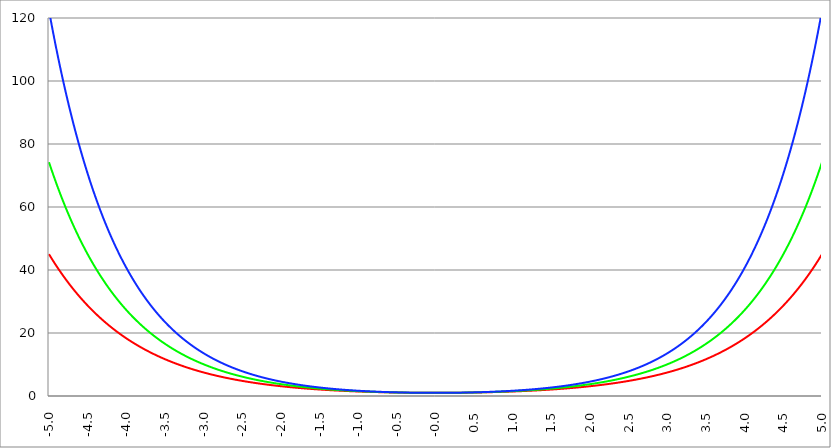
| Category | Series 1 | Series 0 | Series 2 |
|---|---|---|---|
| -5.0 | 45.014 | 74.21 | 122.348 |
| -4.995 | 44.812 | 73.84 | 121.677 |
| -4.99 | 44.611 | 73.472 | 121.01 |
| -4.985 | 44.411 | 73.105 | 120.346 |
| -4.98 | 44.211 | 72.741 | 119.686 |
| -4.975 | 44.013 | 72.378 | 119.029 |
| -4.97 | 43.815 | 72.017 | 118.377 |
| -4.965000000000001 | 43.619 | 71.658 | 117.727 |
| -4.960000000000001 | 43.423 | 71.3 | 117.082 |
| -4.955000000000001 | 43.228 | 70.945 | 116.439 |
| -4.950000000000001 | 43.034 | 70.591 | 115.801 |
| -4.945000000000001 | 42.841 | 70.239 | 115.166 |
| -4.940000000000001 | 42.648 | 69.889 | 114.534 |
| -4.935000000000001 | 42.457 | 69.54 | 113.906 |
| -4.930000000000001 | 42.266 | 69.193 | 113.281 |
| -4.925000000000002 | 42.077 | 68.848 | 112.66 |
| -4.920000000000002 | 41.888 | 68.505 | 112.042 |
| -4.915000000000002 | 41.7 | 68.163 | 111.427 |
| -4.910000000000002 | 41.513 | 67.823 | 110.816 |
| -4.905000000000002 | 41.326 | 67.485 | 110.208 |
| -4.900000000000002 | 41.141 | 67.149 | 109.604 |
| -4.895000000000002 | 40.956 | 66.814 | 109.003 |
| -4.890000000000002 | 40.772 | 66.481 | 108.405 |
| -4.885000000000002 | 40.589 | 66.149 | 107.81 |
| -4.880000000000002 | 40.407 | 65.819 | 107.219 |
| -4.875000000000003 | 40.226 | 65.491 | 106.631 |
| -4.870000000000003 | 40.045 | 65.164 | 106.046 |
| -4.865000000000003 | 39.865 | 64.839 | 105.465 |
| -4.860000000000003 | 39.687 | 64.516 | 104.886 |
| -4.855000000000003 | 39.508 | 64.194 | 104.311 |
| -4.850000000000003 | 39.331 | 63.874 | 103.739 |
| -4.845000000000003 | 39.155 | 63.556 | 103.17 |
| -4.840000000000003 | 38.979 | 63.239 | 102.604 |
| -4.835000000000003 | 38.804 | 62.923 | 102.041 |
| -4.830000000000004 | 38.63 | 62.609 | 101.482 |
| -4.825000000000004 | 38.456 | 62.297 | 100.925 |
| -4.820000000000004 | 38.284 | 61.987 | 100.371 |
| -4.815000000000004 | 38.112 | 61.677 | 99.821 |
| -4.810000000000004 | 37.941 | 61.37 | 99.273 |
| -4.805000000000004 | 37.77 | 61.064 | 98.729 |
| -4.800000000000004 | 37.601 | 60.759 | 98.187 |
| -4.795000000000004 | 37.432 | 60.456 | 97.649 |
| -4.790000000000004 | 37.264 | 60.155 | 97.113 |
| -4.785000000000004 | 37.097 | 59.855 | 96.581 |
| -4.780000000000004 | 36.93 | 59.556 | 96.051 |
| -4.775000000000004 | 36.765 | 59.259 | 95.524 |
| -4.770000000000004 | 36.6 | 58.964 | 95 |
| -4.765000000000005 | 36.435 | 58.67 | 94.479 |
| -4.760000000000005 | 36.272 | 58.377 | 93.961 |
| -4.755000000000005 | 36.109 | 58.086 | 93.446 |
| -4.750000000000005 | 35.947 | 57.796 | 92.933 |
| -4.745000000000005 | 35.786 | 57.508 | 92.424 |
| -4.740000000000005 | 35.625 | 57.221 | 91.917 |
| -4.735000000000005 | 35.465 | 56.936 | 91.413 |
| -4.730000000000005 | 35.306 | 56.652 | 90.911 |
| -4.725000000000006 | 35.148 | 56.37 | 90.413 |
| -4.720000000000006 | 34.99 | 56.089 | 89.917 |
| -4.715000000000006 | 34.833 | 55.809 | 89.424 |
| -4.710000000000006 | 34.676 | 55.531 | 88.933 |
| -4.705000000000006 | 34.521 | 55.254 | 88.445 |
| -4.700000000000006 | 34.366 | 54.978 | 87.96 |
| -4.695000000000006 | 34.212 | 54.704 | 87.478 |
| -4.690000000000006 | 34.058 | 54.431 | 86.998 |
| -4.685000000000007 | 33.905 | 54.16 | 86.521 |
| -4.680000000000007 | 33.753 | 53.89 | 86.046 |
| -4.675000000000007 | 33.602 | 53.621 | 85.574 |
| -4.670000000000007 | 33.451 | 53.354 | 85.105 |
| -4.665000000000007 | 33.301 | 53.088 | 84.638 |
| -4.660000000000007 | 33.151 | 52.823 | 84.174 |
| -4.655000000000007 | 33.002 | 52.559 | 83.713 |
| -4.650000000000007 | 32.854 | 52.297 | 83.253 |
| -4.645000000000007 | 32.707 | 52.036 | 82.797 |
| -4.640000000000008 | 32.56 | 51.777 | 82.343 |
| -4.635000000000008 | 32.414 | 51.519 | 81.891 |
| -4.630000000000008 | 32.269 | 51.262 | 81.442 |
| -4.625000000000008 | 32.124 | 51.006 | 80.995 |
| -4.620000000000008 | 31.98 | 50.752 | 80.551 |
| -4.615000000000008 | 31.836 | 50.499 | 80.109 |
| -4.610000000000008 | 31.693 | 50.247 | 79.67 |
| -4.605000000000008 | 31.551 | 49.996 | 79.233 |
| -4.600000000000008 | 31.409 | 49.747 | 78.798 |
| -4.595000000000009 | 31.268 | 49.499 | 78.366 |
| -4.590000000000009 | 31.128 | 49.252 | 77.936 |
| -4.585000000000009 | 30.988 | 49.007 | 77.509 |
| -4.580000000000009 | 30.849 | 48.762 | 77.084 |
| -4.57500000000001 | 30.711 | 48.519 | 76.661 |
| -4.57000000000001 | 30.573 | 48.277 | 76.241 |
| -4.565000000000009 | 30.436 | 48.037 | 75.823 |
| -4.560000000000009 | 30.299 | 47.797 | 75.407 |
| -4.555000000000009 | 30.163 | 47.559 | 74.993 |
| -4.55000000000001 | 30.028 | 47.321 | 74.582 |
| -4.54500000000001 | 29.893 | 47.086 | 74.173 |
| -4.54000000000001 | 29.759 | 46.851 | 73.766 |
| -4.53500000000001 | 29.626 | 46.617 | 73.361 |
| -4.53000000000001 | 29.493 | 46.385 | 72.959 |
| -4.52500000000001 | 29.36 | 46.153 | 72.559 |
| -4.52000000000001 | 29.229 | 45.923 | 72.161 |
| -4.51500000000001 | 29.097 | 45.694 | 71.765 |
| -4.51000000000001 | 28.967 | 45.466 | 71.372 |
| -4.505000000000011 | 28.837 | 45.24 | 70.98 |
| -4.500000000000011 | 28.707 | 45.014 | 70.591 |
| -4.495000000000011 | 28.579 | 44.79 | 70.204 |
| -4.490000000000011 | 28.45 | 44.566 | 69.819 |
| -4.485000000000011 | 28.323 | 44.344 | 69.436 |
| -4.480000000000011 | 28.196 | 44.123 | 69.055 |
| -4.475000000000011 | 28.069 | 43.903 | 68.676 |
| -4.470000000000011 | 27.943 | 43.684 | 68.3 |
| -4.465000000000011 | 27.818 | 43.466 | 67.925 |
| -4.460000000000011 | 27.693 | 43.25 | 67.553 |
| -4.455000000000012 | 27.569 | 43.034 | 67.182 |
| -4.450000000000012 | 27.445 | 42.819 | 66.814 |
| -4.445000000000012 | 27.322 | 42.606 | 66.447 |
| -4.440000000000012 | 27.199 | 42.393 | 66.083 |
| -4.435000000000012 | 27.077 | 42.182 | 65.72 |
| -4.430000000000012 | 26.956 | 41.972 | 65.36 |
| -4.425000000000012 | 26.835 | 41.762 | 65.002 |
| -4.420000000000012 | 26.714 | 41.554 | 64.645 |
| -4.415000000000012 | 26.595 | 41.347 | 64.291 |
| -4.410000000000013 | 26.475 | 41.141 | 63.938 |
| -4.405000000000013 | 26.356 | 40.936 | 63.587 |
| -4.400000000000013 | 26.238 | 40.732 | 63.239 |
| -4.395000000000013 | 26.12 | 40.528 | 62.892 |
| -4.390000000000013 | 26.003 | 40.326 | 62.547 |
| -4.385000000000013 | 25.887 | 40.125 | 62.204 |
| -4.380000000000013 | 25.77 | 39.925 | 61.863 |
| -4.375000000000013 | 25.655 | 39.726 | 61.523 |
| -4.370000000000013 | 25.54 | 39.528 | 61.186 |
| -4.365000000000013 | 25.425 | 39.331 | 60.851 |
| -4.360000000000014 | 25.311 | 39.135 | 60.517 |
| -4.355000000000014 | 25.198 | 38.94 | 60.185 |
| -4.350000000000014 | 25.085 | 38.746 | 59.855 |
| -4.345000000000014 | 24.972 | 38.553 | 59.527 |
| -4.340000000000014 | 24.86 | 38.36 | 59.2 |
| -4.335000000000014 | 24.748 | 38.169 | 58.875 |
| -4.330000000000014 | 24.637 | 37.979 | 58.553 |
| -4.325000000000014 | 24.527 | 37.789 | 58.232 |
| -4.320000000000014 | 24.417 | 37.601 | 57.912 |
| -4.315000000000015 | 24.307 | 37.413 | 57.595 |
| -4.310000000000015 | 24.198 | 37.227 | 57.279 |
| -4.305000000000015 | 24.09 | 37.041 | 56.965 |
| -4.300000000000015 | 23.982 | 36.857 | 56.652 |
| -4.295000000000015 | 23.874 | 36.673 | 56.342 |
| -4.290000000000015 | 23.767 | 36.49 | 56.033 |
| -4.285000000000015 | 23.66 | 36.308 | 55.725 |
| -4.280000000000015 | 23.554 | 36.127 | 55.42 |
| -4.275000000000015 | 23.449 | 35.947 | 55.116 |
| -4.270000000000015 | 23.343 | 35.768 | 54.813 |
| -4.265000000000016 | 23.239 | 35.589 | 54.513 |
| -4.260000000000016 | 23.134 | 35.412 | 54.214 |
| -4.255000000000016 | 23.031 | 35.236 | 53.917 |
| -4.250000000000016 | 22.927 | 35.06 | 53.621 |
| -4.245000000000016 | 22.824 | 34.885 | 53.327 |
| -4.240000000000016 | 22.722 | 34.711 | 53.034 |
| -4.235000000000016 | 22.62 | 34.538 | 52.744 |
| -4.230000000000016 | 22.519 | 34.366 | 52.454 |
| -4.225000000000017 | 22.418 | 34.195 | 52.167 |
| -4.220000000000017 | 22.317 | 34.024 | 51.881 |
| -4.215000000000017 | 22.217 | 33.854 | 51.596 |
| -4.210000000000017 | 22.117 | 33.686 | 51.313 |
| -4.205000000000017 | 22.018 | 33.518 | 51.032 |
| -4.200000000000017 | 21.919 | 33.351 | 50.752 |
| -4.195000000000017 | 21.821 | 33.184 | 50.474 |
| -4.190000000000017 | 21.723 | 33.019 | 50.197 |
| -4.185000000000017 | 21.626 | 32.854 | 49.922 |
| -4.180000000000017 | 21.529 | 32.691 | 49.648 |
| -4.175000000000018 | 21.432 | 32.528 | 49.376 |
| -4.170000000000018 | 21.336 | 32.365 | 49.105 |
| -4.165000000000018 | 21.24 | 32.204 | 48.836 |
| -4.160000000000018 | 21.145 | 32.044 | 48.568 |
| -4.155000000000018 | 21.05 | 31.884 | 48.301 |
| -4.150000000000018 | 20.956 | 31.725 | 48.037 |
| -4.145000000000018 | 20.862 | 31.567 | 47.773 |
| -4.140000000000018 | 20.768 | 31.409 | 47.511 |
| -4.135000000000018 | 20.675 | 31.253 | 47.251 |
| -4.130000000000019 | 20.583 | 31.097 | 46.991 |
| -4.125000000000019 | 20.49 | 30.942 | 46.734 |
| -4.120000000000019 | 20.398 | 30.788 | 46.478 |
| -4.115000000000019 | 20.307 | 30.634 | 46.223 |
| -4.110000000000019 | 20.216 | 30.482 | 45.969 |
| -4.105000000000019 | 20.125 | 30.33 | 45.717 |
| -4.100000000000019 | 20.035 | 30.178 | 45.466 |
| -4.095000000000019 | 19.945 | 30.028 | 45.217 |
| -4.090000000000019 | 19.856 | 29.878 | 44.969 |
| -4.085000000000019 | 19.767 | 29.729 | 44.723 |
| -4.08000000000002 | 19.678 | 29.581 | 44.477 |
| -4.07500000000002 | 19.59 | 29.434 | 44.233 |
| -4.07000000000002 | 19.502 | 29.287 | 43.991 |
| -4.06500000000002 | 19.414 | 29.141 | 43.75 |
| -4.06000000000002 | 19.327 | 28.996 | 43.51 |
| -4.05500000000002 | 19.241 | 28.851 | 43.271 |
| -4.05000000000002 | 19.154 | 28.707 | 43.034 |
| -4.04500000000002 | 19.069 | 28.564 | 42.798 |
| -4.04000000000002 | 18.983 | 28.422 | 42.563 |
| -4.03500000000002 | 18.898 | 28.28 | 42.33 |
| -4.03000000000002 | 18.813 | 28.139 | 42.098 |
| -4.025000000000021 | 18.729 | 27.999 | 41.867 |
| -4.020000000000021 | 18.645 | 27.86 | 41.637 |
| -4.015000000000021 | 18.561 | 27.721 | 41.409 |
| -4.010000000000021 | 18.478 | 27.583 | 41.182 |
| -4.005000000000021 | 18.395 | 27.445 | 40.956 |
| -4.000000000000021 | 18.313 | 27.308 | 40.732 |
| -3.995000000000021 | 18.231 | 27.172 | 40.508 |
| -3.990000000000021 | 18.149 | 27.037 | 40.286 |
| -3.985000000000022 | 18.068 | 26.902 | 40.065 |
| -3.980000000000022 | 17.987 | 26.768 | 39.846 |
| -3.975000000000022 | 17.906 | 26.634 | 39.627 |
| -3.970000000000022 | 17.826 | 26.502 | 39.41 |
| -3.965000000000022 | 17.746 | 26.37 | 39.194 |
| -3.960000000000022 | 17.666 | 26.238 | 38.979 |
| -3.955000000000022 | 17.587 | 26.107 | 38.765 |
| -3.950000000000022 | 17.508 | 25.977 | 38.553 |
| -3.945000000000022 | 17.43 | 25.848 | 38.341 |
| -3.940000000000023 | 17.352 | 25.719 | 38.131 |
| -3.935000000000023 | 17.274 | 25.591 | 37.922 |
| -3.930000000000023 | 17.196 | 25.463 | 37.714 |
| -3.925000000000023 | 17.119 | 25.336 | 37.507 |
| -3.920000000000023 | 17.043 | 25.21 | 37.301 |
| -3.915000000000023 | 16.966 | 25.085 | 37.097 |
| -3.910000000000023 | 16.89 | 24.959 | 36.894 |
| -3.905000000000023 | 16.814 | 24.835 | 36.691 |
| -3.900000000000023 | 16.739 | 24.711 | 36.49 |
| -3.895000000000023 | 16.664 | 24.588 | 36.29 |
| -3.890000000000024 | 16.589 | 24.466 | 36.091 |
| -3.885000000000024 | 16.515 | 24.344 | 35.893 |
| -3.880000000000024 | 16.441 | 24.222 | 35.696 |
| -3.875000000000024 | 16.367 | 24.102 | 35.501 |
| -3.870000000000024 | 16.294 | 23.982 | 35.306 |
| -3.865000000000024 | 16.221 | 23.862 | 35.112 |
| -3.860000000000024 | 16.148 | 23.743 | 34.92 |
| -3.855000000000024 | 16.076 | 23.625 | 34.728 |
| -3.850000000000024 | 16.004 | 23.507 | 34.538 |
| -3.845000000000025 | 15.932 | 23.39 | 34.349 |
| -3.840000000000025 | 15.861 | 23.273 | 34.16 |
| -3.835000000000025 | 15.79 | 23.158 | 33.973 |
| -3.830000000000025 | 15.719 | 23.042 | 33.787 |
| -3.825000000000025 | 15.649 | 22.927 | 33.602 |
| -3.820000000000025 | 15.578 | 22.813 | 33.417 |
| -3.815000000000025 | 15.509 | 22.699 | 33.234 |
| -3.810000000000025 | 15.439 | 22.586 | 33.052 |
| -3.805000000000025 | 15.37 | 22.474 | 32.871 |
| -3.800000000000026 | 15.301 | 22.362 | 32.691 |
| -3.795000000000026 | 15.233 | 22.25 | 32.511 |
| -3.790000000000026 | 15.164 | 22.139 | 32.333 |
| -3.785000000000026 | 15.096 | 22.029 | 32.156 |
| -3.780000000000026 | 15.029 | 21.919 | 31.98 |
| -3.775000000000026 | 14.961 | 21.81 | 31.804 |
| -3.770000000000026 | 14.894 | 21.702 | 31.63 |
| -3.765000000000026 | 14.828 | 21.593 | 31.456 |
| -3.760000000000026 | 14.761 | 21.486 | 31.284 |
| -3.755000000000026 | 14.695 | 21.379 | 31.113 |
| -3.750000000000027 | 14.629 | 21.272 | 30.942 |
| -3.745000000000027 | 14.564 | 21.166 | 30.772 |
| -3.740000000000027 | 14.498 | 21.061 | 30.604 |
| -3.735000000000027 | 14.434 | 20.956 | 30.436 |
| -3.730000000000027 | 14.369 | 20.852 | 30.269 |
| -3.725000000000027 | 14.305 | 20.748 | 30.103 |
| -3.720000000000027 | 14.24 | 20.644 | 29.938 |
| -3.715000000000027 | 14.177 | 20.541 | 29.774 |
| -3.710000000000027 | 14.113 | 20.439 | 29.611 |
| -3.705000000000028 | 14.05 | 20.337 | 29.448 |
| -3.700000000000028 | 13.987 | 20.236 | 29.287 |
| -3.695000000000028 | 13.924 | 20.135 | 29.126 |
| -3.690000000000028 | 13.862 | 20.035 | 28.967 |
| -3.685000000000028 | 13.8 | 19.935 | 28.808 |
| -3.680000000000028 | 13.738 | 19.836 | 28.65 |
| -3.675000000000028 | 13.677 | 19.737 | 28.493 |
| -3.670000000000028 | 13.615 | 19.639 | 28.337 |
| -3.665000000000028 | 13.554 | 19.541 | 28.182 |
| -3.660000000000028 | 13.494 | 19.444 | 28.027 |
| -3.655000000000029 | 13.433 | 19.347 | 27.873 |
| -3.650000000000029 | 13.373 | 19.25 | 27.721 |
| -3.645000000000029 | 13.313 | 19.154 | 27.569 |
| -3.640000000000029 | 13.254 | 19.059 | 27.418 |
| -3.635000000000029 | 13.194 | 18.964 | 27.267 |
| -3.630000000000029 | 13.135 | 18.87 | 27.118 |
| -3.625000000000029 | 13.077 | 18.776 | 26.969 |
| -3.620000000000029 | 13.018 | 18.682 | 26.821 |
| -3.615000000000029 | 12.96 | 18.589 | 26.674 |
| -3.61000000000003 | 12.902 | 18.497 | 26.528 |
| -3.60500000000003 | 12.844 | 18.404 | 26.383 |
| -3.60000000000003 | 12.786 | 18.313 | 26.238 |
| -3.59500000000003 | 12.729 | 18.222 | 26.094 |
| -3.59000000000003 | 12.672 | 18.131 | 25.951 |
| -3.58500000000003 | 12.616 | 18.041 | 25.809 |
| -3.58000000000003 | 12.559 | 17.951 | 25.668 |
| -3.57500000000003 | 12.503 | 17.861 | 25.527 |
| -3.57000000000003 | 12.447 | 17.772 | 25.387 |
| -3.565000000000031 | 12.391 | 17.684 | 25.248 |
| -3.560000000000031 | 12.336 | 17.596 | 25.11 |
| -3.555000000000031 | 12.281 | 17.508 | 24.972 |
| -3.550000000000031 | 12.226 | 17.421 | 24.835 |
| -3.545000000000031 | 12.171 | 17.334 | 24.699 |
| -3.540000000000031 | 12.116 | 17.248 | 24.564 |
| -3.535000000000031 | 12.062 | 17.162 | 24.429 |
| -3.530000000000031 | 12.008 | 17.077 | 24.295 |
| -3.525000000000031 | 11.954 | 16.992 | 24.162 |
| -3.520000000000032 | 11.901 | 16.907 | 24.03 |
| -3.515000000000032 | 11.848 | 16.823 | 23.898 |
| -3.510000000000032 | 11.795 | 16.739 | 23.767 |
| -3.505000000000032 | 11.742 | 16.656 | 23.637 |
| -3.500000000000032 | 11.689 | 16.573 | 23.507 |
| -3.495000000000032 | 11.637 | 16.49 | 23.378 |
| -3.490000000000032 | 11.585 | 16.408 | 23.25 |
| -3.485000000000032 | 11.533 | 16.327 | 23.123 |
| -3.480000000000032 | 11.482 | 16.245 | 22.996 |
| -3.475000000000032 | 11.43 | 16.164 | 22.87 |
| -3.470000000000033 | 11.379 | 16.084 | 22.745 |
| -3.465000000000033 | 11.328 | 16.004 | 22.62 |
| -3.460000000000033 | 11.278 | 15.924 | 22.496 |
| -3.455000000000033 | 11.227 | 15.845 | 22.373 |
| -3.450000000000033 | 11.177 | 15.766 | 22.25 |
| -3.445000000000033 | 11.127 | 15.688 | 22.128 |
| -3.440000000000033 | 11.077 | 15.61 | 22.007 |
| -3.435000000000033 | 11.028 | 15.532 | 21.887 |
| -3.430000000000033 | 10.978 | 15.455 | 21.767 |
| -3.425000000000034 | 10.929 | 15.378 | 21.647 |
| -3.420000000000034 | 10.88 | 15.301 | 21.529 |
| -3.415000000000034 | 10.832 | 15.225 | 21.411 |
| -3.410000000000034 | 10.783 | 15.149 | 21.294 |
| -3.405000000000034 | 10.735 | 15.074 | 21.177 |
| -3.400000000000034 | 10.687 | 14.999 | 21.061 |
| -3.395000000000034 | 10.639 | 14.924 | 20.945 |
| -3.390000000000034 | 10.592 | 14.85 | 20.831 |
| -3.385000000000034 | 10.545 | 14.776 | 20.717 |
| -3.380000000000034 | 10.497 | 14.702 | 20.603 |
| -3.375000000000035 | 10.451 | 14.629 | 20.49 |
| -3.370000000000035 | 10.404 | 14.556 | 20.378 |
| -3.365000000000035 | 10.357 | 14.484 | 20.266 |
| -3.360000000000035 | 10.311 | 14.412 | 20.155 |
| -3.355000000000035 | 10.265 | 14.34 | 20.045 |
| -3.350000000000035 | 10.219 | 14.269 | 19.935 |
| -3.345000000000035 | 10.173 | 14.198 | 19.826 |
| -3.340000000000035 | 10.128 | 14.127 | 19.717 |
| -3.335000000000035 | 10.083 | 14.057 | 19.609 |
| -3.330000000000036 | 10.038 | 13.987 | 19.502 |
| -3.325000000000036 | 9.993 | 13.917 | 19.395 |
| -3.320000000000036 | 9.948 | 13.848 | 19.289 |
| -3.315000000000036 | 9.904 | 13.779 | 19.183 |
| -3.310000000000036 | 9.859 | 13.711 | 19.078 |
| -3.305000000000036 | 9.815 | 13.643 | 18.974 |
| -3.300000000000036 | 9.772 | 13.575 | 18.87 |
| -3.295000000000036 | 9.728 | 13.507 | 18.766 |
| -3.290000000000036 | 9.685 | 13.44 | 18.664 |
| -3.285000000000036 | 9.641 | 13.373 | 18.561 |
| -3.280000000000036 | 9.598 | 13.307 | 18.46 |
| -3.275000000000037 | 9.555 | 13.241 | 18.359 |
| -3.270000000000037 | 9.513 | 13.175 | 18.258 |
| -3.265000000000037 | 9.47 | 13.109 | 18.158 |
| -3.260000000000037 | 9.428 | 13.044 | 18.059 |
| -3.255000000000037 | 9.386 | 12.979 | 17.96 |
| -3.250000000000037 | 9.344 | 12.915 | 17.861 |
| -3.245000000000037 | 9.302 | 12.85 | 17.764 |
| -3.240000000000037 | 9.261 | 12.786 | 17.666 |
| -3.235000000000038 | 9.219 | 12.723 | 17.569 |
| -3.230000000000038 | 9.178 | 12.66 | 17.473 |
| -3.225000000000038 | 9.137 | 12.597 | 17.378 |
| -3.220000000000038 | 9.096 | 12.534 | 17.282 |
| -3.215000000000038 | 9.056 | 12.472 | 17.188 |
| -3.210000000000038 | 9.015 | 12.41 | 17.094 |
| -3.205000000000038 | 8.975 | 12.348 | 17 |
| -3.200000000000038 | 8.935 | 12.287 | 16.907 |
| -3.195000000000038 | 8.895 | 12.226 | 16.814 |
| -3.190000000000039 | 8.856 | 12.165 | 16.722 |
| -3.185000000000039 | 8.816 | 12.104 | 16.631 |
| -3.180000000000039 | 8.777 | 12.044 | 16.54 |
| -3.175000000000039 | 8.738 | 11.984 | 16.449 |
| -3.170000000000039 | 8.699 | 11.925 | 16.359 |
| -3.16500000000004 | 8.66 | 11.865 | 16.27 |
| -3.16000000000004 | 8.621 | 11.807 | 16.181 |
| -3.155000000000039 | 8.583 | 11.748 | 16.092 |
| -3.150000000000039 | 8.545 | 11.689 | 16.004 |
| -3.14500000000004 | 8.506 | 11.631 | 15.916 |
| -3.14000000000004 | 8.469 | 11.574 | 15.829 |
| -3.13500000000004 | 8.431 | 11.516 | 15.742 |
| -3.13000000000004 | 8.393 | 11.459 | 15.656 |
| -3.12500000000004 | 8.356 | 11.402 | 15.571 |
| -3.12000000000004 | 8.319 | 11.345 | 15.485 |
| -3.11500000000004 | 8.281 | 11.289 | 15.401 |
| -3.11000000000004 | 8.245 | 11.233 | 15.316 |
| -3.10500000000004 | 8.208 | 11.177 | 15.233 |
| -3.10000000000004 | 8.171 | 11.122 | 15.149 |
| -3.095000000000041 | 8.135 | 11.066 | 15.066 |
| -3.090000000000041 | 8.099 | 11.011 | 14.984 |
| -3.085000000000041 | 8.062 | 10.957 | 14.902 |
| -3.080000000000041 | 8.027 | 10.902 | 14.82 |
| -3.075000000000041 | 7.991 | 10.848 | 14.739 |
| -3.070000000000041 | 7.955 | 10.794 | 14.658 |
| -3.065000000000041 | 7.92 | 10.741 | 14.578 |
| -3.060000000000041 | 7.885 | 10.687 | 14.498 |
| -3.055000000000041 | 7.849 | 10.634 | 14.419 |
| -3.050000000000042 | 7.814 | 10.581 | 14.34 |
| -3.045000000000042 | 7.78 | 10.529 | 14.262 |
| -3.040000000000042 | 7.745 | 10.477 | 14.184 |
| -3.035000000000042 | 7.711 | 10.425 | 14.106 |
| -3.030000000000042 | 7.676 | 10.373 | 14.029 |
| -3.025000000000042 | 7.642 | 10.321 | 13.952 |
| -3.020000000000042 | 7.608 | 10.27 | 13.876 |
| -3.015000000000042 | 7.574 | 10.219 | 13.8 |
| -3.010000000000042 | 7.54 | 10.168 | 13.725 |
| -3.005000000000043 | 7.507 | 10.118 | 13.649 |
| -3.000000000000043 | 7.473 | 10.068 | 13.575 |
| -2.995000000000043 | 7.44 | 10.018 | 13.501 |
| -2.990000000000043 | 7.407 | 9.968 | 13.427 |
| -2.985000000000043 | 7.374 | 9.919 | 13.353 |
| -2.980000000000043 | 7.341 | 9.869 | 13.28 |
| -2.975000000000043 | 7.309 | 9.82 | 13.208 |
| -2.970000000000043 | 7.276 | 9.772 | 13.135 |
| -2.965000000000043 | 7.244 | 9.723 | 13.063 |
| -2.960000000000043 | 7.212 | 9.675 | 12.992 |
| -2.955000000000044 | 7.18 | 9.627 | 12.921 |
| -2.950000000000044 | 7.148 | 9.579 | 12.85 |
| -2.945000000000044 | 7.116 | 9.532 | 12.78 |
| -2.940000000000044 | 7.084 | 9.484 | 12.71 |
| -2.935000000000044 | 7.053 | 9.437 | 12.641 |
| -2.930000000000044 | 7.021 | 9.391 | 12.572 |
| -2.925000000000044 | 6.99 | 9.344 | 12.503 |
| -2.920000000000044 | 6.959 | 9.298 | 12.434 |
| -2.915000000000044 | 6.928 | 9.252 | 12.367 |
| -2.910000000000045 | 6.897 | 9.206 | 12.299 |
| -2.905000000000045 | 6.867 | 9.16 | 12.232 |
| -2.900000000000045 | 6.836 | 9.115 | 12.165 |
| -2.895000000000045 | 6.806 | 9.069 | 12.098 |
| -2.890000000000045 | 6.776 | 9.024 | 12.032 |
| -2.885000000000045 | 6.746 | 8.98 | 11.966 |
| -2.880000000000045 | 6.716 | 8.935 | 11.901 |
| -2.875000000000045 | 6.686 | 8.891 | 11.836 |
| -2.870000000000045 | 6.656 | 8.847 | 11.771 |
| -2.865000000000045 | 6.627 | 8.803 | 11.707 |
| -2.860000000000046 | 6.597 | 8.759 | 11.643 |
| -2.855000000000046 | 6.568 | 8.716 | 11.579 |
| -2.850000000000046 | 6.539 | 8.673 | 11.516 |
| -2.845000000000046 | 6.51 | 8.63 | 11.453 |
| -2.840000000000046 | 6.481 | 8.587 | 11.391 |
| -2.835000000000046 | 6.452 | 8.545 | 11.328 |
| -2.830000000000046 | 6.424 | 8.502 | 11.266 |
| -2.825000000000046 | 6.395 | 8.46 | 11.205 |
| -2.820000000000046 | 6.367 | 8.418 | 11.144 |
| -2.815000000000047 | 6.338 | 8.377 | 11.083 |
| -2.810000000000047 | 6.31 | 8.335 | 11.022 |
| -2.805000000000047 | 6.282 | 8.294 | 10.962 |
| -2.800000000000047 | 6.255 | 8.253 | 10.902 |
| -2.795000000000047 | 6.227 | 8.212 | 10.843 |
| -2.790000000000047 | 6.199 | 8.171 | 10.783 |
| -2.785000000000047 | 6.172 | 8.131 | 10.725 |
| -2.780000000000047 | 6.144 | 8.091 | 10.666 |
| -2.775000000000047 | 6.117 | 8.05 | 10.608 |
| -2.770000000000047 | 6.09 | 8.011 | 10.55 |
| -2.765000000000048 | 6.063 | 7.971 | 10.492 |
| -2.760000000000048 | 6.036 | 7.932 | 10.435 |
| -2.755000000000048 | 6.01 | 7.892 | 10.378 |
| -2.750000000000048 | 5.983 | 7.853 | 10.321 |
| -2.745000000000048 | 5.956 | 7.814 | 10.265 |
| -2.740000000000048 | 5.93 | 7.776 | 10.209 |
| -2.735000000000048 | 5.904 | 7.737 | 10.153 |
| -2.730000000000048 | 5.878 | 7.699 | 10.098 |
| -2.725000000000048 | 5.852 | 7.661 | 10.043 |
| -2.720000000000049 | 5.826 | 7.623 | 9.988 |
| -2.715000000000049 | 5.8 | 7.585 | 9.933 |
| -2.710000000000049 | 5.774 | 7.548 | 9.879 |
| -2.705000000000049 | 5.749 | 7.511 | 9.825 |
| -2.700000000000049 | 5.723 | 7.473 | 9.772 |
| -2.695000000000049 | 5.698 | 7.437 | 9.718 |
| -2.690000000000049 | 5.673 | 7.4 | 9.665 |
| -2.685000000000049 | 5.648 | 7.363 | 9.613 |
| -2.680000000000049 | 5.623 | 7.327 | 9.56 |
| -2.675000000000049 | 5.598 | 7.291 | 9.508 |
| -2.67000000000005 | 5.573 | 7.255 | 9.456 |
| -2.66500000000005 | 5.549 | 7.219 | 9.405 |
| -2.66000000000005 | 5.524 | 7.183 | 9.353 |
| -2.65500000000005 | 5.5 | 7.148 | 9.302 |
| -2.65000000000005 | 5.476 | 7.112 | 9.252 |
| -2.64500000000005 | 5.451 | 7.077 | 9.201 |
| -2.64000000000005 | 5.427 | 7.042 | 9.151 |
| -2.63500000000005 | 5.403 | 7.008 | 9.101 |
| -2.63000000000005 | 5.38 | 6.973 | 9.051 |
| -2.625000000000051 | 5.356 | 6.939 | 9.002 |
| -2.620000000000051 | 5.332 | 6.904 | 8.953 |
| -2.615000000000051 | 5.309 | 6.87 | 8.904 |
| -2.610000000000051 | 5.285 | 6.836 | 8.856 |
| -2.605000000000051 | 5.262 | 6.803 | 8.807 |
| -2.600000000000051 | 5.239 | 6.769 | 8.759 |
| -2.595000000000051 | 5.216 | 6.736 | 8.712 |
| -2.590000000000051 | 5.193 | 6.702 | 8.664 |
| -2.585000000000051 | 5.17 | 6.669 | 8.617 |
| -2.580000000000052 | 5.147 | 6.636 | 8.57 |
| -2.575000000000052 | 5.124 | 6.604 | 8.523 |
| -2.570000000000052 | 5.102 | 6.571 | 8.477 |
| -2.565000000000052 | 5.079 | 6.539 | 8.431 |
| -2.560000000000052 | 5.057 | 6.507 | 8.385 |
| -2.555000000000052 | 5.035 | 6.474 | 8.339 |
| -2.550000000000052 | 5.013 | 6.443 | 8.294 |
| -2.545000000000052 | 4.991 | 6.411 | 8.249 |
| -2.540000000000052 | 4.969 | 6.379 | 8.204 |
| -2.535000000000053 | 4.947 | 6.348 | 8.159 |
| -2.530000000000053 | 4.925 | 6.317 | 8.115 |
| -2.525000000000053 | 4.903 | 6.285 | 8.07 |
| -2.520000000000053 | 4.882 | 6.255 | 8.027 |
| -2.515000000000053 | 4.86 | 6.224 | 7.983 |
| -2.510000000000053 | 4.839 | 6.193 | 7.939 |
| -2.505000000000053 | 4.818 | 6.163 | 7.896 |
| -2.500000000000053 | 4.797 | 6.132 | 7.853 |
| -2.495000000000053 | 4.776 | 6.102 | 7.811 |
| -2.490000000000053 | 4.755 | 6.072 | 7.768 |
| -2.485000000000054 | 4.734 | 6.042 | 7.726 |
| -2.480000000000054 | 4.713 | 6.013 | 7.684 |
| -2.475000000000054 | 4.692 | 5.983 | 7.642 |
| -2.470000000000054 | 4.672 | 5.954 | 7.6 |
| -2.465000000000054 | 4.651 | 5.924 | 7.559 |
| -2.460000000000054 | 4.631 | 5.895 | 7.518 |
| -2.455000000000054 | 4.61 | 5.866 | 7.477 |
| -2.450000000000054 | 4.59 | 5.837 | 7.437 |
| -2.445000000000054 | 4.57 | 5.809 | 7.396 |
| -2.440000000000055 | 4.55 | 5.78 | 7.356 |
| -2.435000000000055 | 4.53 | 5.752 | 7.316 |
| -2.430000000000055 | 4.51 | 5.723 | 7.276 |
| -2.425000000000055 | 4.491 | 5.695 | 7.237 |
| -2.420000000000055 | 4.471 | 5.667 | 7.197 |
| -2.415000000000055 | 4.451 | 5.64 | 7.158 |
| -2.410000000000055 | 4.432 | 5.612 | 7.119 |
| -2.405000000000055 | 4.413 | 5.584 | 7.081 |
| -2.400000000000055 | 4.393 | 5.557 | 7.042 |
| -2.395000000000055 | 4.374 | 5.53 | 7.004 |
| -2.390000000000056 | 4.355 | 5.503 | 6.966 |
| -2.385000000000056 | 4.336 | 5.476 | 6.928 |
| -2.380000000000056 | 4.317 | 5.449 | 6.891 |
| -2.375000000000056 | 4.298 | 5.422 | 6.853 |
| -2.370000000000056 | 4.279 | 5.395 | 6.816 |
| -2.365000000000056 | 4.261 | 5.369 | 6.779 |
| -2.360000000000056 | 4.242 | 5.343 | 6.742 |
| -2.355000000000056 | 4.224 | 5.317 | 6.706 |
| -2.350000000000056 | 4.205 | 5.29 | 6.669 |
| -2.345000000000057 | 4.187 | 5.265 | 6.633 |
| -2.340000000000057 | 4.169 | 5.239 | 6.597 |
| -2.335000000000057 | 4.15 | 5.213 | 6.561 |
| -2.330000000000057 | 4.132 | 5.188 | 6.526 |
| -2.325000000000057 | 4.114 | 5.162 | 6.491 |
| -2.320000000000057 | 4.096 | 5.137 | 6.455 |
| -2.315000000000057 | 4.079 | 5.112 | 6.42 |
| -2.310000000000057 | 4.061 | 5.087 | 6.386 |
| -2.305000000000057 | 4.043 | 5.062 | 6.351 |
| -2.300000000000058 | 4.026 | 5.037 | 6.317 |
| -2.295000000000058 | 4.008 | 5.013 | 6.282 |
| -2.290000000000058 | 3.991 | 4.988 | 6.248 |
| -2.285000000000058 | 3.973 | 4.964 | 6.215 |
| -2.280000000000058 | 3.956 | 4.939 | 6.181 |
| -2.275000000000058 | 3.939 | 4.915 | 6.147 |
| -2.270000000000058 | 3.922 | 4.891 | 6.114 |
| -2.265000000000058 | 3.905 | 4.867 | 6.081 |
| -2.260000000000058 | 3.888 | 4.844 | 6.048 |
| -2.255000000000058 | 3.871 | 4.82 | 6.015 |
| -2.250000000000059 | 3.854 | 4.797 | 5.983 |
| -2.245000000000059 | 3.837 | 4.773 | 5.951 |
| -2.240000000000059 | 3.821 | 4.75 | 5.918 |
| -2.235000000000059 | 3.804 | 4.727 | 5.886 |
| -2.23000000000006 | 3.788 | 4.704 | 5.855 |
| -2.22500000000006 | 3.771 | 4.681 | 5.823 |
| -2.22000000000006 | 3.755 | 4.658 | 5.791 |
| -2.215000000000059 | 3.739 | 4.635 | 5.76 |
| -2.210000000000059 | 3.723 | 4.613 | 5.729 |
| -2.20500000000006 | 3.706 | 4.59 | 5.698 |
| -2.20000000000006 | 3.69 | 4.568 | 5.667 |
| -2.19500000000006 | 3.674 | 4.546 | 5.637 |
| -2.19000000000006 | 3.659 | 4.524 | 5.606 |
| -2.18500000000006 | 3.643 | 4.502 | 5.576 |
| -2.18000000000006 | 3.627 | 4.48 | 5.546 |
| -2.17500000000006 | 3.611 | 4.458 | 5.516 |
| -2.17000000000006 | 3.596 | 4.436 | 5.486 |
| -2.16500000000006 | 3.58 | 4.415 | 5.457 |
| -2.160000000000061 | 3.565 | 4.393 | 5.427 |
| -2.155000000000061 | 3.55 | 4.372 | 5.398 |
| -2.150000000000061 | 3.534 | 4.351 | 5.369 |
| -2.145000000000061 | 3.519 | 4.33 | 5.34 |
| -2.140000000000061 | 3.504 | 4.309 | 5.311 |
| -2.135000000000061 | 3.489 | 4.288 | 5.283 |
| -2.130000000000061 | 3.474 | 4.267 | 5.254 |
| -2.125000000000061 | 3.459 | 4.246 | 5.226 |
| -2.120000000000061 | 3.444 | 4.226 | 5.198 |
| -2.115000000000061 | 3.429 | 4.205 | 5.17 |
| -2.110000000000062 | 3.414 | 4.185 | 5.142 |
| -2.105000000000062 | 3.4 | 4.164 | 5.114 |
| -2.100000000000062 | 3.385 | 4.144 | 5.087 |
| -2.095000000000062 | 3.371 | 4.124 | 5.059 |
| -2.090000000000062 | 3.356 | 4.104 | 5.032 |
| -2.085000000000062 | 3.342 | 4.084 | 5.005 |
| -2.080000000000062 | 3.328 | 4.065 | 4.978 |
| -2.075000000000062 | 3.313 | 4.045 | 4.952 |
| -2.070000000000062 | 3.299 | 4.026 | 4.925 |
| -2.065000000000063 | 3.285 | 4.006 | 4.899 |
| -2.060000000000063 | 3.271 | 3.987 | 4.872 |
| -2.055000000000063 | 3.257 | 3.967 | 4.846 |
| -2.050000000000063 | 3.243 | 3.948 | 4.82 |
| -2.045000000000063 | 3.229 | 3.929 | 4.794 |
| -2.040000000000063 | 3.215 | 3.91 | 4.769 |
| -2.035000000000063 | 3.202 | 3.891 | 4.743 |
| -2.030000000000063 | 3.188 | 3.873 | 4.718 |
| -2.025000000000063 | 3.174 | 3.854 | 4.692 |
| -2.020000000000064 | 3.161 | 3.835 | 4.667 |
| -2.015000000000064 | 3.147 | 3.817 | 4.642 |
| -2.010000000000064 | 3.134 | 3.799 | 4.617 |
| -2.005000000000064 | 3.121 | 3.78 | 4.592 |
| -2.000000000000064 | 3.107 | 3.762 | 4.568 |
| -1.995000000000064 | 3.094 | 3.744 | 4.543 |
| -1.990000000000064 | 3.081 | 3.726 | 4.519 |
| -1.985000000000064 | 3.068 | 3.708 | 4.495 |
| -1.980000000000064 | 3.055 | 3.69 | 4.471 |
| -1.975000000000064 | 3.042 | 3.673 | 4.447 |
| -1.970000000000065 | 3.029 | 3.655 | 4.423 |
| -1.965000000000065 | 3.016 | 3.638 | 4.4 |
| -1.960000000000065 | 3.004 | 3.62 | 4.376 |
| -1.955000000000065 | 2.991 | 3.603 | 4.353 |
| -1.950000000000065 | 2.978 | 3.585 | 4.33 |
| -1.945000000000065 | 2.966 | 3.568 | 4.306 |
| -1.940000000000065 | 2.953 | 3.551 | 4.283 |
| -1.935000000000065 | 2.941 | 3.534 | 4.261 |
| -1.930000000000065 | 2.928 | 3.517 | 4.238 |
| -1.925000000000066 | 2.916 | 3.501 | 4.215 |
| -1.920000000000066 | 2.904 | 3.484 | 4.193 |
| -1.915000000000066 | 2.891 | 3.467 | 4.171 |
| -1.910000000000066 | 2.879 | 3.451 | 4.148 |
| -1.905000000000066 | 2.867 | 3.434 | 4.126 |
| -1.900000000000066 | 2.855 | 3.418 | 4.104 |
| -1.895000000000066 | 2.843 | 3.401 | 4.082 |
| -1.890000000000066 | 2.831 | 3.385 | 4.061 |
| -1.885000000000066 | 2.819 | 3.369 | 4.039 |
| -1.880000000000066 | 2.807 | 3.353 | 4.018 |
| -1.875000000000067 | 2.795 | 3.337 | 3.996 |
| -1.870000000000067 | 2.784 | 3.321 | 3.975 |
| -1.865000000000067 | 2.772 | 3.305 | 3.954 |
| -1.860000000000067 | 2.76 | 3.29 | 3.933 |
| -1.855000000000067 | 2.749 | 3.274 | 3.912 |
| -1.850000000000067 | 2.737 | 3.259 | 3.891 |
| -1.845000000000067 | 2.726 | 3.243 | 3.871 |
| -1.840000000000067 | 2.715 | 3.228 | 3.85 |
| -1.835000000000067 | 2.703 | 3.212 | 3.83 |
| -1.830000000000068 | 2.692 | 3.197 | 3.81 |
| -1.825000000000068 | 2.681 | 3.182 | 3.79 |
| -1.820000000000068 | 2.67 | 3.167 | 3.769 |
| -1.815000000000068 | 2.659 | 3.152 | 3.75 |
| -1.810000000000068 | 2.647 | 3.137 | 3.73 |
| -1.805000000000068 | 2.636 | 3.122 | 3.71 |
| -1.800000000000068 | 2.625 | 3.107 | 3.69 |
| -1.795000000000068 | 2.615 | 3.093 | 3.671 |
| -1.790000000000068 | 2.604 | 3.078 | 3.652 |
| -1.785000000000068 | 2.593 | 3.064 | 3.632 |
| -1.780000000000069 | 2.582 | 3.049 | 3.613 |
| -1.775000000000069 | 2.572 | 3.035 | 3.594 |
| -1.770000000000069 | 2.561 | 3.021 | 3.575 |
| -1.765000000000069 | 2.55 | 3.006 | 3.556 |
| -1.760000000000069 | 2.54 | 2.992 | 3.538 |
| -1.75500000000007 | 2.529 | 2.978 | 3.519 |
| -1.75000000000007 | 2.519 | 2.964 | 3.501 |
| -1.745000000000069 | 2.508 | 2.95 | 3.482 |
| -1.740000000000069 | 2.498 | 2.936 | 3.464 |
| -1.73500000000007 | 2.488 | 2.923 | 3.446 |
| -1.73000000000007 | 2.478 | 2.909 | 3.428 |
| -1.72500000000007 | 2.467 | 2.895 | 3.41 |
| -1.72000000000007 | 2.457 | 2.882 | 3.392 |
| -1.71500000000007 | 2.447 | 2.868 | 3.374 |
| -1.71000000000007 | 2.437 | 2.855 | 3.356 |
| -1.70500000000007 | 2.427 | 2.842 | 3.339 |
| -1.70000000000007 | 2.417 | 2.828 | 3.321 |
| -1.69500000000007 | 2.407 | 2.815 | 3.304 |
| -1.69000000000007 | 2.398 | 2.802 | 3.287 |
| -1.685000000000071 | 2.388 | 2.789 | 3.269 |
| -1.680000000000071 | 2.378 | 2.776 | 3.252 |
| -1.675000000000071 | 2.368 | 2.763 | 3.235 |
| -1.670000000000071 | 2.359 | 2.75 | 3.218 |
| -1.665000000000071 | 2.349 | 2.737 | 3.202 |
| -1.660000000000071 | 2.34 | 2.725 | 3.185 |
| -1.655000000000071 | 2.33 | 2.712 | 3.168 |
| -1.650000000000071 | 2.321 | 2.7 | 3.152 |
| -1.645000000000071 | 2.311 | 2.687 | 3.136 |
| -1.640000000000072 | 2.302 | 2.675 | 3.119 |
| -1.635000000000072 | 2.293 | 2.662 | 3.103 |
| -1.630000000000072 | 2.283 | 2.65 | 3.087 |
| -1.625000000000072 | 2.274 | 2.638 | 3.071 |
| -1.620000000000072 | 2.265 | 2.625 | 3.055 |
| -1.615000000000072 | 2.256 | 2.613 | 3.039 |
| -1.610000000000072 | 2.247 | 2.601 | 3.023 |
| -1.605000000000072 | 2.238 | 2.589 | 3.008 |
| -1.600000000000072 | 2.229 | 2.577 | 2.992 |
| -1.595000000000073 | 2.22 | 2.566 | 2.977 |
| -1.590000000000073 | 2.211 | 2.554 | 2.961 |
| -1.585000000000073 | 2.202 | 2.542 | 2.946 |
| -1.580000000000073 | 2.193 | 2.53 | 2.931 |
| -1.575000000000073 | 2.185 | 2.519 | 2.916 |
| -1.570000000000073 | 2.176 | 2.507 | 2.901 |
| -1.565000000000073 | 2.167 | 2.496 | 2.886 |
| -1.560000000000073 | 2.159 | 2.484 | 2.871 |
| -1.555000000000073 | 2.15 | 2.473 | 2.856 |
| -1.550000000000074 | 2.141 | 2.462 | 2.842 |
| -1.545000000000074 | 2.133 | 2.451 | 2.827 |
| -1.540000000000074 | 2.124 | 2.439 | 2.812 |
| -1.535000000000074 | 2.116 | 2.428 | 2.798 |
| -1.530000000000074 | 2.108 | 2.417 | 2.784 |
| -1.525000000000074 | 2.099 | 2.406 | 2.769 |
| -1.520000000000074 | 2.091 | 2.395 | 2.755 |
| -1.515000000000074 | 2.083 | 2.385 | 2.741 |
| -1.510000000000074 | 2.075 | 2.374 | 2.727 |
| -1.505000000000074 | 2.066 | 2.363 | 2.713 |
| -1.500000000000075 | 2.058 | 2.352 | 2.7 |
| -1.495000000000075 | 2.05 | 2.342 | 2.686 |
| -1.490000000000075 | 2.042 | 2.331 | 2.672 |
| -1.485000000000075 | 2.034 | 2.321 | 2.659 |
| -1.480000000000075 | 2.026 | 2.31 | 2.645 |
| -1.475000000000075 | 2.018 | 2.3 | 2.632 |
| -1.470000000000075 | 2.011 | 2.29 | 2.618 |
| -1.465000000000075 | 2.003 | 2.279 | 2.605 |
| -1.460000000000075 | 1.995 | 2.269 | 2.592 |
| -1.455000000000076 | 1.987 | 2.259 | 2.579 |
| -1.450000000000076 | 1.979 | 2.249 | 2.566 |
| -1.445000000000076 | 1.972 | 2.239 | 2.553 |
| -1.440000000000076 | 1.964 | 2.229 | 2.54 |
| -1.435000000000076 | 1.957 | 2.219 | 2.527 |
| -1.430000000000076 | 1.949 | 2.209 | 2.514 |
| -1.425000000000076 | 1.941 | 2.199 | 2.502 |
| -1.420000000000076 | 1.934 | 2.189 | 2.489 |
| -1.415000000000076 | 1.927 | 2.18 | 2.477 |
| -1.410000000000077 | 1.919 | 2.17 | 2.464 |
| -1.405000000000077 | 1.912 | 2.16 | 2.452 |
| -1.400000000000077 | 1.905 | 2.151 | 2.439 |
| -1.395000000000077 | 1.897 | 2.141 | 2.427 |
| -1.390000000000077 | 1.89 | 2.132 | 2.415 |
| -1.385000000000077 | 1.883 | 2.123 | 2.403 |
| -1.380000000000077 | 1.876 | 2.113 | 2.391 |
| -1.375000000000077 | 1.869 | 2.104 | 2.379 |
| -1.370000000000077 | 1.861 | 2.095 | 2.367 |
| -1.365000000000077 | 1.854 | 2.086 | 2.356 |
| -1.360000000000078 | 1.847 | 2.076 | 2.344 |
| -1.355000000000078 | 1.84 | 2.067 | 2.332 |
| -1.350000000000078 | 1.834 | 2.058 | 2.321 |
| -1.345000000000078 | 1.827 | 2.049 | 2.309 |
| -1.340000000000078 | 1.82 | 2.04 | 2.298 |
| -1.335000000000078 | 1.813 | 2.032 | 2.286 |
| -1.330000000000078 | 1.806 | 2.023 | 2.275 |
| -1.325000000000078 | 1.799 | 2.014 | 2.264 |
| -1.320000000000078 | 1.793 | 2.005 | 2.253 |
| -1.315000000000079 | 1.786 | 1.997 | 2.242 |
| -1.310000000000079 | 1.779 | 1.988 | 2.231 |
| -1.305000000000079 | 1.773 | 1.979 | 2.22 |
| -1.300000000000079 | 1.766 | 1.971 | 2.209 |
| -1.295000000000079 | 1.76 | 1.962 | 2.198 |
| -1.29000000000008 | 1.753 | 1.954 | 2.187 |
| -1.285000000000079 | 1.747 | 1.946 | 2.177 |
| -1.280000000000079 | 1.74 | 1.937 | 2.166 |
| -1.275000000000079 | 1.734 | 1.929 | 2.156 |
| -1.270000000000079 | 1.728 | 1.921 | 2.145 |
| -1.26500000000008 | 1.721 | 1.913 | 2.135 |
| -1.26000000000008 | 1.715 | 1.905 | 2.124 |
| -1.25500000000008 | 1.709 | 1.896 | 2.114 |
| -1.25000000000008 | 1.702 | 1.888 | 2.104 |
| -1.24500000000008 | 1.696 | 1.88 | 2.094 |
| -1.24000000000008 | 1.69 | 1.872 | 2.084 |
| -1.23500000000008 | 1.684 | 1.865 | 2.074 |
| -1.23000000000008 | 1.678 | 1.857 | 2.064 |
| -1.22500000000008 | 1.672 | 1.849 | 2.054 |
| -1.220000000000081 | 1.666 | 1.841 | 2.044 |
| -1.215000000000081 | 1.66 | 1.834 | 2.034 |
| -1.210000000000081 | 1.654 | 1.826 | 2.025 |
| -1.205000000000081 | 1.648 | 1.818 | 2.015 |
| -1.200000000000081 | 1.642 | 1.811 | 2.005 |
| -1.195000000000081 | 1.636 | 1.803 | 1.996 |
| -1.190000000000081 | 1.63 | 1.796 | 1.986 |
| -1.185000000000081 | 1.625 | 1.788 | 1.977 |
| -1.180000000000081 | 1.619 | 1.781 | 1.968 |
| -1.175000000000082 | 1.613 | 1.773 | 1.958 |
| -1.170000000000082 | 1.608 | 1.766 | 1.949 |
| -1.165000000000082 | 1.602 | 1.759 | 1.94 |
| -1.160000000000082 | 1.596 | 1.752 | 1.931 |
| -1.155000000000082 | 1.591 | 1.745 | 1.922 |
| -1.150000000000082 | 1.585 | 1.737 | 1.913 |
| -1.145000000000082 | 1.58 | 1.73 | 1.904 |
| -1.140000000000082 | 1.574 | 1.723 | 1.895 |
| -1.135000000000082 | 1.569 | 1.716 | 1.886 |
| -1.130000000000082 | 1.563 | 1.709 | 1.877 |
| -1.125000000000083 | 1.558 | 1.702 | 1.869 |
| -1.120000000000083 | 1.553 | 1.696 | 1.86 |
| -1.115000000000083 | 1.547 | 1.689 | 1.851 |
| -1.110000000000083 | 1.542 | 1.682 | 1.843 |
| -1.105000000000083 | 1.537 | 1.675 | 1.834 |
| -1.100000000000083 | 1.531 | 1.669 | 1.826 |
| -1.095000000000083 | 1.526 | 1.662 | 1.817 |
| -1.090000000000083 | 1.521 | 1.655 | 1.809 |
| -1.085000000000083 | 1.516 | 1.649 | 1.801 |
| -1.080000000000084 | 1.511 | 1.642 | 1.793 |
| -1.075000000000084 | 1.506 | 1.636 | 1.785 |
| -1.070000000000084 | 1.501 | 1.629 | 1.776 |
| -1.065000000000084 | 1.496 | 1.623 | 1.768 |
| -1.060000000000084 | 1.491 | 1.616 | 1.76 |
| -1.055000000000084 | 1.486 | 1.61 | 1.752 |
| -1.050000000000084 | 1.481 | 1.604 | 1.745 |
| -1.045000000000084 | 1.476 | 1.598 | 1.737 |
| -1.040000000000084 | 1.471 | 1.591 | 1.729 |
| -1.035000000000085 | 1.466 | 1.585 | 1.721 |
| -1.030000000000085 | 1.461 | 1.579 | 1.714 |
| -1.025000000000085 | 1.457 | 1.573 | 1.706 |
| -1.020000000000085 | 1.452 | 1.567 | 1.698 |
| -1.015000000000085 | 1.447 | 1.561 | 1.691 |
| -1.010000000000085 | 1.442 | 1.555 | 1.683 |
| -1.005000000000085 | 1.438 | 1.549 | 1.676 |
| -1.000000000000085 | 1.433 | 1.543 | 1.669 |
| -0.995000000000085 | 1.428 | 1.537 | 1.661 |
| -0.990000000000085 | 1.424 | 1.531 | 1.654 |
| -0.985000000000085 | 1.419 | 1.526 | 1.647 |
| -0.980000000000085 | 1.415 | 1.52 | 1.64 |
| -0.975000000000085 | 1.41 | 1.514 | 1.632 |
| -0.970000000000085 | 1.406 | 1.509 | 1.625 |
| -0.965000000000085 | 1.401 | 1.503 | 1.618 |
| -0.960000000000085 | 1.397 | 1.497 | 1.611 |
| -0.955000000000085 | 1.393 | 1.492 | 1.604 |
| -0.950000000000085 | 1.388 | 1.486 | 1.598 |
| -0.945000000000085 | 1.384 | 1.481 | 1.591 |
| -0.940000000000085 | 1.38 | 1.475 | 1.584 |
| -0.935000000000085 | 1.375 | 1.47 | 1.577 |
| -0.930000000000085 | 1.371 | 1.465 | 1.571 |
| -0.925000000000085 | 1.367 | 1.459 | 1.564 |
| -0.920000000000085 | 1.363 | 1.454 | 1.557 |
| -0.915000000000085 | 1.359 | 1.449 | 1.551 |
| -0.910000000000085 | 1.355 | 1.443 | 1.544 |
| -0.905000000000085 | 1.35 | 1.438 | 1.538 |
| -0.900000000000085 | 1.346 | 1.433 | 1.531 |
| -0.895000000000085 | 1.342 | 1.428 | 1.525 |
| -0.890000000000085 | 1.338 | 1.423 | 1.519 |
| -0.885000000000085 | 1.334 | 1.418 | 1.512 |
| -0.880000000000085 | 1.33 | 1.413 | 1.506 |
| -0.875000000000085 | 1.326 | 1.408 | 1.5 |
| -0.870000000000085 | 1.323 | 1.403 | 1.494 |
| -0.865000000000085 | 1.319 | 1.398 | 1.488 |
| -0.860000000000085 | 1.315 | 1.393 | 1.482 |
| -0.855000000000085 | 1.311 | 1.388 | 1.476 |
| -0.850000000000085 | 1.307 | 1.384 | 1.47 |
| -0.845000000000085 | 1.303 | 1.379 | 1.464 |
| -0.840000000000085 | 1.3 | 1.374 | 1.458 |
| -0.835000000000085 | 1.296 | 1.369 | 1.452 |
| -0.830000000000085 | 1.292 | 1.365 | 1.447 |
| -0.825000000000085 | 1.289 | 1.36 | 1.441 |
| -0.820000000000085 | 1.285 | 1.355 | 1.435 |
| -0.815000000000085 | 1.281 | 1.351 | 1.43 |
| -0.810000000000085 | 1.278 | 1.346 | 1.424 |
| -0.805000000000085 | 1.274 | 1.342 | 1.418 |
| -0.800000000000085 | 1.271 | 1.337 | 1.413 |
| -0.795000000000085 | 1.267 | 1.333 | 1.407 |
| -0.790000000000085 | 1.264 | 1.329 | 1.402 |
| -0.785000000000085 | 1.26 | 1.324 | 1.397 |
| -0.780000000000085 | 1.257 | 1.32 | 1.391 |
| -0.775000000000085 | 1.253 | 1.316 | 1.386 |
| -0.770000000000085 | 1.25 | 1.311 | 1.381 |
| -0.765000000000085 | 1.247 | 1.307 | 1.375 |
| -0.760000000000085 | 1.243 | 1.303 | 1.37 |
| -0.755000000000085 | 1.24 | 1.299 | 1.365 |
| -0.750000000000085 | 1.237 | 1.295 | 1.36 |
| -0.745000000000085 | 1.233 | 1.291 | 1.355 |
| -0.740000000000085 | 1.23 | 1.287 | 1.35 |
| -0.735000000000085 | 1.227 | 1.282 | 1.345 |
| -0.730000000000085 | 1.224 | 1.278 | 1.34 |
| -0.725000000000085 | 1.221 | 1.275 | 1.335 |
| -0.720000000000085 | 1.217 | 1.271 | 1.33 |
| -0.715000000000085 | 1.214 | 1.267 | 1.326 |
| -0.710000000000085 | 1.211 | 1.263 | 1.321 |
| -0.705000000000085 | 1.208 | 1.259 | 1.316 |
| -0.700000000000085 | 1.205 | 1.255 | 1.311 |
| -0.695000000000085 | 1.202 | 1.251 | 1.307 |
| -0.690000000000085 | 1.199 | 1.248 | 1.302 |
| -0.685000000000085 | 1.196 | 1.244 | 1.298 |
| -0.680000000000085 | 1.193 | 1.24 | 1.293 |
| -0.675000000000085 | 1.19 | 1.237 | 1.289 |
| -0.670000000000085 | 1.187 | 1.233 | 1.284 |
| -0.665000000000085 | 1.185 | 1.229 | 1.28 |
| -0.660000000000085 | 1.182 | 1.226 | 1.275 |
| -0.655000000000085 | 1.179 | 1.222 | 1.271 |
| -0.650000000000085 | 1.176 | 1.219 | 1.267 |
| -0.645000000000085 | 1.173 | 1.215 | 1.262 |
| -0.640000000000085 | 1.171 | 1.212 | 1.258 |
| -0.635000000000085 | 1.168 | 1.208 | 1.254 |
| -0.630000000000085 | 1.165 | 1.205 | 1.25 |
| -0.625000000000085 | 1.162 | 1.202 | 1.246 |
| -0.620000000000085 | 1.16 | 1.198 | 1.242 |
| -0.615000000000085 | 1.157 | 1.195 | 1.238 |
| -0.610000000000085 | 1.155 | 1.192 | 1.234 |
| -0.605000000000085 | 1.152 | 1.189 | 1.23 |
| -0.600000000000085 | 1.149 | 1.185 | 1.226 |
| -0.595000000000085 | 1.147 | 1.182 | 1.222 |
| -0.590000000000085 | 1.144 | 1.179 | 1.218 |
| -0.585000000000085 | 1.142 | 1.176 | 1.214 |
| -0.580000000000085 | 1.139 | 1.173 | 1.211 |
| -0.575000000000085 | 1.137 | 1.17 | 1.207 |
| -0.570000000000085 | 1.134 | 1.167 | 1.203 |
| -0.565000000000085 | 1.132 | 1.164 | 1.199 |
| -0.560000000000085 | 1.13 | 1.161 | 1.196 |
| -0.555000000000085 | 1.127 | 1.158 | 1.192 |
| -0.550000000000085 | 1.125 | 1.155 | 1.189 |
| -0.545000000000085 | 1.123 | 1.152 | 1.185 |
| -0.540000000000085 | 1.12 | 1.149 | 1.182 |
| -0.535000000000085 | 1.118 | 1.147 | 1.178 |
| -0.530000000000085 | 1.116 | 1.144 | 1.175 |
| -0.525000000000085 | 1.114 | 1.141 | 1.171 |
| -0.520000000000085 | 1.112 | 1.138 | 1.168 |
| -0.515000000000085 | 1.109 | 1.136 | 1.165 |
| -0.510000000000085 | 1.107 | 1.133 | 1.162 |
| -0.505000000000085 | 1.105 | 1.13 | 1.158 |
| -0.500000000000085 | 1.103 | 1.128 | 1.155 |
| -0.495000000000085 | 1.101 | 1.125 | 1.152 |
| -0.490000000000085 | 1.099 | 1.122 | 1.149 |
| -0.485000000000085 | 1.097 | 1.12 | 1.146 |
| -0.480000000000085 | 1.095 | 1.117 | 1.143 |
| -0.475000000000085 | 1.093 | 1.115 | 1.14 |
| -0.470000000000085 | 1.091 | 1.112 | 1.137 |
| -0.465000000000085 | 1.089 | 1.11 | 1.134 |
| -0.460000000000085 | 1.087 | 1.108 | 1.131 |
| -0.455000000000085 | 1.085 | 1.105 | 1.128 |
| -0.450000000000085 | 1.083 | 1.103 | 1.125 |
| -0.445000000000085 | 1.081 | 1.101 | 1.122 |
| -0.440000000000085 | 1.079 | 1.098 | 1.119 |
| -0.435000000000085 | 1.078 | 1.096 | 1.117 |
| -0.430000000000085 | 1.076 | 1.094 | 1.114 |
| -0.425000000000085 | 1.074 | 1.092 | 1.111 |
| -0.420000000000085 | 1.072 | 1.09 | 1.109 |
| -0.415000000000085 | 1.071 | 1.087 | 1.106 |
| -0.410000000000085 | 1.069 | 1.085 | 1.103 |
| -0.405000000000085 | 1.067 | 1.083 | 1.101 |
| -0.400000000000085 | 1.066 | 1.081 | 1.098 |
| -0.395000000000085 | 1.064 | 1.079 | 1.096 |
| -0.390000000000085 | 1.062 | 1.077 | 1.093 |
| -0.385000000000085 | 1.061 | 1.075 | 1.091 |
| -0.380000000000085 | 1.059 | 1.073 | 1.089 |
| -0.375000000000085 | 1.057 | 1.071 | 1.086 |
| -0.370000000000085 | 1.056 | 1.069 | 1.084 |
| -0.365000000000085 | 1.054 | 1.067 | 1.082 |
| -0.360000000000085 | 1.053 | 1.066 | 1.079 |
| -0.355000000000085 | 1.051 | 1.064 | 1.077 |
| -0.350000000000085 | 1.05 | 1.062 | 1.075 |
| -0.345000000000085 | 1.049 | 1.06 | 1.073 |
| -0.340000000000085 | 1.047 | 1.058 | 1.071 |
| -0.335000000000085 | 1.046 | 1.057 | 1.069 |
| -0.330000000000085 | 1.044 | 1.055 | 1.067 |
| -0.325000000000085 | 1.043 | 1.053 | 1.065 |
| -0.320000000000085 | 1.042 | 1.052 | 1.063 |
| -0.315000000000085 | 1.04 | 1.05 | 1.061 |
| -0.310000000000085 | 1.039 | 1.048 | 1.059 |
| -0.305000000000085 | 1.038 | 1.047 | 1.057 |
| -0.300000000000085 | 1.037 | 1.045 | 1.055 |
| -0.295000000000085 | 1.035 | 1.044 | 1.053 |
| -0.290000000000085 | 1.034 | 1.042 | 1.051 |
| -0.285000000000085 | 1.033 | 1.041 | 1.05 |
| -0.280000000000085 | 1.032 | 1.039 | 1.048 |
| -0.275000000000085 | 1.031 | 1.038 | 1.046 |
| -0.270000000000085 | 1.03 | 1.037 | 1.044 |
| -0.265000000000085 | 1.029 | 1.035 | 1.043 |
| -0.260000000000085 | 1.028 | 1.034 | 1.041 |
| -0.255000000000085 | 1.026 | 1.033 | 1.04 |
| -0.250000000000085 | 1.025 | 1.031 | 1.038 |
| -0.245000000000085 | 1.024 | 1.03 | 1.037 |
| -0.240000000000085 | 1.023 | 1.029 | 1.035 |
| -0.235000000000085 | 1.022 | 1.028 | 1.034 |
| -0.230000000000085 | 1.022 | 1.027 | 1.032 |
| -0.225000000000085 | 1.021 | 1.025 | 1.031 |
| -0.220000000000085 | 1.02 | 1.024 | 1.029 |
| -0.215000000000085 | 1.019 | 1.023 | 1.028 |
| -0.210000000000085 | 1.018 | 1.022 | 1.027 |
| -0.205000000000085 | 1.017 | 1.021 | 1.026 |
| -0.200000000000085 | 1.016 | 1.02 | 1.024 |
| -0.195000000000085 | 1.015 | 1.019 | 1.023 |
| -0.190000000000085 | 1.015 | 1.018 | 1.022 |
| -0.185000000000085 | 1.014 | 1.017 | 1.021 |
| -0.180000000000085 | 1.013 | 1.016 | 1.02 |
| -0.175000000000085 | 1.012 | 1.015 | 1.019 |
| -0.170000000000085 | 1.012 | 1.014 | 1.018 |
| -0.165000000000085 | 1.011 | 1.014 | 1.017 |
| -0.160000000000085 | 1.01 | 1.013 | 1.016 |
| -0.155000000000084 | 1.01 | 1.012 | 1.015 |
| -0.150000000000084 | 1.009 | 1.011 | 1.014 |
| -0.145000000000084 | 1.009 | 1.011 | 1.013 |
| -0.140000000000084 | 1.008 | 1.01 | 1.012 |
| -0.135000000000084 | 1.007 | 1.009 | 1.011 |
| -0.130000000000084 | 1.007 | 1.008 | 1.01 |
| -0.125000000000084 | 1.006 | 1.008 | 1.009 |
| -0.120000000000084 | 1.006 | 1.007 | 1.009 |
| -0.115000000000084 | 1.005 | 1.007 | 1.008 |
| -0.110000000000084 | 1.005 | 1.006 | 1.007 |
| -0.105000000000084 | 1.004 | 1.006 | 1.007 |
| -0.100000000000084 | 1.004 | 1.005 | 1.006 |
| -0.0950000000000844 | 1.004 | 1.005 | 1.005 |
| -0.0900000000000844 | 1.003 | 1.004 | 1.005 |
| -0.0850000000000844 | 1.003 | 1.004 | 1.004 |
| -0.0800000000000844 | 1.003 | 1.003 | 1.004 |
| -0.0750000000000844 | 1.002 | 1.003 | 1.003 |
| -0.0700000000000844 | 1.002 | 1.002 | 1.003 |
| -0.0650000000000844 | 1.002 | 1.002 | 1.003 |
| -0.0600000000000844 | 1.001 | 1.002 | 1.002 |
| -0.0550000000000844 | 1.001 | 1.002 | 1.002 |
| -0.0500000000000844 | 1.001 | 1.001 | 1.002 |
| -0.0450000000000844 | 1.001 | 1.001 | 1.001 |
| -0.0400000000000844 | 1.001 | 1.001 | 1.001 |
| -0.0350000000000844 | 1 | 1.001 | 1.001 |
| -0.0300000000000844 | 1 | 1 | 1.001 |
| -0.0250000000000844 | 1 | 1 | 1 |
| -0.0200000000000844 | 1 | 1 | 1 |
| -0.0150000000000844 | 1 | 1 | 1 |
| -0.0100000000000844 | 1 | 1 | 1 |
| -0.00500000000008444 | 1 | 1 | 1 |
| -8.4444604087075e-14 | 1 | 1 | 1 |
| 0.00499999999991555 | 1 | 1 | 1 |
| 0.00999999999991555 | 1 | 1 | 1 |
| 0.0149999999999156 | 1 | 1 | 1 |
| 0.0199999999999156 | 1 | 1 | 1 |
| 0.0249999999999156 | 1 | 1 | 1 |
| 0.0299999999999156 | 1 | 1 | 1.001 |
| 0.0349999999999155 | 1 | 1.001 | 1.001 |
| 0.0399999999999155 | 1.001 | 1.001 | 1.001 |
| 0.0449999999999155 | 1.001 | 1.001 | 1.001 |
| 0.0499999999999155 | 1.001 | 1.001 | 1.002 |
| 0.0549999999999155 | 1.001 | 1.002 | 1.002 |
| 0.0599999999999155 | 1.001 | 1.002 | 1.002 |
| 0.0649999999999155 | 1.002 | 1.002 | 1.003 |
| 0.0699999999999155 | 1.002 | 1.002 | 1.003 |
| 0.0749999999999155 | 1.002 | 1.003 | 1.003 |
| 0.0799999999999155 | 1.003 | 1.003 | 1.004 |
| 0.0849999999999155 | 1.003 | 1.004 | 1.004 |
| 0.0899999999999155 | 1.003 | 1.004 | 1.005 |
| 0.0949999999999155 | 1.004 | 1.005 | 1.005 |
| 0.0999999999999155 | 1.004 | 1.005 | 1.006 |
| 0.104999999999916 | 1.004 | 1.006 | 1.007 |
| 0.109999999999916 | 1.005 | 1.006 | 1.007 |
| 0.114999999999916 | 1.005 | 1.007 | 1.008 |
| 0.119999999999916 | 1.006 | 1.007 | 1.009 |
| 0.124999999999916 | 1.006 | 1.008 | 1.009 |
| 0.129999999999916 | 1.007 | 1.008 | 1.01 |
| 0.134999999999916 | 1.007 | 1.009 | 1.011 |
| 0.139999999999916 | 1.008 | 1.01 | 1.012 |
| 0.144999999999916 | 1.009 | 1.011 | 1.013 |
| 0.149999999999916 | 1.009 | 1.011 | 1.014 |
| 0.154999999999916 | 1.01 | 1.012 | 1.015 |
| 0.159999999999916 | 1.01 | 1.013 | 1.016 |
| 0.164999999999916 | 1.011 | 1.014 | 1.017 |
| 0.169999999999916 | 1.012 | 1.014 | 1.018 |
| 0.174999999999916 | 1.012 | 1.015 | 1.019 |
| 0.179999999999916 | 1.013 | 1.016 | 1.02 |
| 0.184999999999916 | 1.014 | 1.017 | 1.021 |
| 0.189999999999916 | 1.015 | 1.018 | 1.022 |
| 0.194999999999916 | 1.015 | 1.019 | 1.023 |
| 0.199999999999916 | 1.016 | 1.02 | 1.024 |
| 0.204999999999916 | 1.017 | 1.021 | 1.026 |
| 0.209999999999916 | 1.018 | 1.022 | 1.027 |
| 0.214999999999916 | 1.019 | 1.023 | 1.028 |
| 0.219999999999916 | 1.02 | 1.024 | 1.029 |
| 0.224999999999916 | 1.021 | 1.025 | 1.031 |
| 0.229999999999916 | 1.022 | 1.027 | 1.032 |
| 0.234999999999916 | 1.022 | 1.028 | 1.034 |
| 0.239999999999916 | 1.023 | 1.029 | 1.035 |
| 0.244999999999916 | 1.024 | 1.03 | 1.037 |
| 0.249999999999916 | 1.025 | 1.031 | 1.038 |
| 0.254999999999916 | 1.026 | 1.033 | 1.04 |
| 0.259999999999916 | 1.028 | 1.034 | 1.041 |
| 0.264999999999916 | 1.029 | 1.035 | 1.043 |
| 0.269999999999916 | 1.03 | 1.037 | 1.044 |
| 0.274999999999916 | 1.031 | 1.038 | 1.046 |
| 0.279999999999916 | 1.032 | 1.039 | 1.048 |
| 0.284999999999916 | 1.033 | 1.041 | 1.05 |
| 0.289999999999916 | 1.034 | 1.042 | 1.051 |
| 0.294999999999916 | 1.035 | 1.044 | 1.053 |
| 0.299999999999916 | 1.037 | 1.045 | 1.055 |
| 0.304999999999916 | 1.038 | 1.047 | 1.057 |
| 0.309999999999916 | 1.039 | 1.048 | 1.059 |
| 0.314999999999916 | 1.04 | 1.05 | 1.061 |
| 0.319999999999916 | 1.042 | 1.052 | 1.063 |
| 0.324999999999916 | 1.043 | 1.053 | 1.065 |
| 0.329999999999916 | 1.044 | 1.055 | 1.067 |
| 0.334999999999916 | 1.046 | 1.057 | 1.069 |
| 0.339999999999916 | 1.047 | 1.058 | 1.071 |
| 0.344999999999916 | 1.049 | 1.06 | 1.073 |
| 0.349999999999916 | 1.05 | 1.062 | 1.075 |
| 0.354999999999916 | 1.051 | 1.064 | 1.077 |
| 0.359999999999916 | 1.053 | 1.066 | 1.079 |
| 0.364999999999916 | 1.054 | 1.067 | 1.082 |
| 0.369999999999916 | 1.056 | 1.069 | 1.084 |
| 0.374999999999916 | 1.057 | 1.071 | 1.086 |
| 0.379999999999916 | 1.059 | 1.073 | 1.089 |
| 0.384999999999916 | 1.061 | 1.075 | 1.091 |
| 0.389999999999916 | 1.062 | 1.077 | 1.093 |
| 0.394999999999916 | 1.064 | 1.079 | 1.096 |
| 0.399999999999916 | 1.066 | 1.081 | 1.098 |
| 0.404999999999916 | 1.067 | 1.083 | 1.101 |
| 0.409999999999916 | 1.069 | 1.085 | 1.103 |
| 0.414999999999916 | 1.071 | 1.087 | 1.106 |
| 0.419999999999916 | 1.072 | 1.09 | 1.109 |
| 0.424999999999916 | 1.074 | 1.092 | 1.111 |
| 0.429999999999916 | 1.076 | 1.094 | 1.114 |
| 0.434999999999916 | 1.078 | 1.096 | 1.117 |
| 0.439999999999916 | 1.079 | 1.098 | 1.119 |
| 0.444999999999916 | 1.081 | 1.101 | 1.122 |
| 0.449999999999916 | 1.083 | 1.103 | 1.125 |
| 0.454999999999916 | 1.085 | 1.105 | 1.128 |
| 0.459999999999916 | 1.087 | 1.108 | 1.131 |
| 0.464999999999916 | 1.089 | 1.11 | 1.134 |
| 0.469999999999916 | 1.091 | 1.112 | 1.137 |
| 0.474999999999916 | 1.093 | 1.115 | 1.14 |
| 0.479999999999916 | 1.095 | 1.117 | 1.143 |
| 0.484999999999916 | 1.097 | 1.12 | 1.146 |
| 0.489999999999916 | 1.099 | 1.122 | 1.149 |
| 0.494999999999916 | 1.101 | 1.125 | 1.152 |
| 0.499999999999916 | 1.103 | 1.128 | 1.155 |
| 0.504999999999916 | 1.105 | 1.13 | 1.158 |
| 0.509999999999916 | 1.107 | 1.133 | 1.162 |
| 0.514999999999916 | 1.109 | 1.136 | 1.165 |
| 0.519999999999916 | 1.112 | 1.138 | 1.168 |
| 0.524999999999916 | 1.114 | 1.141 | 1.171 |
| 0.529999999999916 | 1.116 | 1.144 | 1.175 |
| 0.534999999999916 | 1.118 | 1.147 | 1.178 |
| 0.539999999999916 | 1.12 | 1.149 | 1.182 |
| 0.544999999999916 | 1.123 | 1.152 | 1.185 |
| 0.549999999999916 | 1.125 | 1.155 | 1.189 |
| 0.554999999999916 | 1.127 | 1.158 | 1.192 |
| 0.559999999999916 | 1.13 | 1.161 | 1.196 |
| 0.564999999999916 | 1.132 | 1.164 | 1.199 |
| 0.569999999999916 | 1.134 | 1.167 | 1.203 |
| 0.574999999999916 | 1.137 | 1.17 | 1.207 |
| 0.579999999999916 | 1.139 | 1.173 | 1.211 |
| 0.584999999999916 | 1.142 | 1.176 | 1.214 |
| 0.589999999999916 | 1.144 | 1.179 | 1.218 |
| 0.594999999999916 | 1.147 | 1.182 | 1.222 |
| 0.599999999999916 | 1.149 | 1.185 | 1.226 |
| 0.604999999999916 | 1.152 | 1.189 | 1.23 |
| 0.609999999999916 | 1.155 | 1.192 | 1.234 |
| 0.614999999999916 | 1.157 | 1.195 | 1.238 |
| 0.619999999999916 | 1.16 | 1.198 | 1.242 |
| 0.624999999999916 | 1.162 | 1.202 | 1.246 |
| 0.629999999999916 | 1.165 | 1.205 | 1.25 |
| 0.634999999999916 | 1.168 | 1.208 | 1.254 |
| 0.639999999999916 | 1.171 | 1.212 | 1.258 |
| 0.644999999999916 | 1.173 | 1.215 | 1.262 |
| 0.649999999999916 | 1.176 | 1.219 | 1.267 |
| 0.654999999999916 | 1.179 | 1.222 | 1.271 |
| 0.659999999999916 | 1.182 | 1.226 | 1.275 |
| 0.664999999999916 | 1.185 | 1.229 | 1.28 |
| 0.669999999999916 | 1.187 | 1.233 | 1.284 |
| 0.674999999999916 | 1.19 | 1.237 | 1.289 |
| 0.679999999999916 | 1.193 | 1.24 | 1.293 |
| 0.684999999999916 | 1.196 | 1.244 | 1.298 |
| 0.689999999999916 | 1.199 | 1.248 | 1.302 |
| 0.694999999999916 | 1.202 | 1.251 | 1.307 |
| 0.699999999999916 | 1.205 | 1.255 | 1.311 |
| 0.704999999999916 | 1.208 | 1.259 | 1.316 |
| 0.709999999999916 | 1.211 | 1.263 | 1.321 |
| 0.714999999999916 | 1.214 | 1.267 | 1.326 |
| 0.719999999999916 | 1.217 | 1.271 | 1.33 |
| 0.724999999999916 | 1.221 | 1.275 | 1.335 |
| 0.729999999999916 | 1.224 | 1.278 | 1.34 |
| 0.734999999999916 | 1.227 | 1.282 | 1.345 |
| 0.739999999999916 | 1.23 | 1.287 | 1.35 |
| 0.744999999999916 | 1.233 | 1.291 | 1.355 |
| 0.749999999999916 | 1.237 | 1.295 | 1.36 |
| 0.754999999999916 | 1.24 | 1.299 | 1.365 |
| 0.759999999999916 | 1.243 | 1.303 | 1.37 |
| 0.764999999999916 | 1.247 | 1.307 | 1.375 |
| 0.769999999999916 | 1.25 | 1.311 | 1.381 |
| 0.774999999999916 | 1.253 | 1.316 | 1.386 |
| 0.779999999999916 | 1.257 | 1.32 | 1.391 |
| 0.784999999999916 | 1.26 | 1.324 | 1.397 |
| 0.789999999999916 | 1.264 | 1.329 | 1.402 |
| 0.794999999999916 | 1.267 | 1.333 | 1.407 |
| 0.799999999999916 | 1.271 | 1.337 | 1.413 |
| 0.804999999999916 | 1.274 | 1.342 | 1.418 |
| 0.809999999999916 | 1.278 | 1.346 | 1.424 |
| 0.814999999999916 | 1.281 | 1.351 | 1.43 |
| 0.819999999999916 | 1.285 | 1.355 | 1.435 |
| 0.824999999999916 | 1.289 | 1.36 | 1.441 |
| 0.829999999999916 | 1.292 | 1.365 | 1.447 |
| 0.834999999999916 | 1.296 | 1.369 | 1.452 |
| 0.839999999999916 | 1.3 | 1.374 | 1.458 |
| 0.844999999999916 | 1.303 | 1.379 | 1.464 |
| 0.849999999999916 | 1.307 | 1.384 | 1.47 |
| 0.854999999999916 | 1.311 | 1.388 | 1.476 |
| 0.859999999999916 | 1.315 | 1.393 | 1.482 |
| 0.864999999999916 | 1.319 | 1.398 | 1.488 |
| 0.869999999999916 | 1.323 | 1.403 | 1.494 |
| 0.874999999999916 | 1.326 | 1.408 | 1.5 |
| 0.879999999999916 | 1.33 | 1.413 | 1.506 |
| 0.884999999999916 | 1.334 | 1.418 | 1.512 |
| 0.889999999999916 | 1.338 | 1.423 | 1.519 |
| 0.894999999999916 | 1.342 | 1.428 | 1.525 |
| 0.899999999999916 | 1.346 | 1.433 | 1.531 |
| 0.904999999999916 | 1.35 | 1.438 | 1.538 |
| 0.909999999999916 | 1.355 | 1.443 | 1.544 |
| 0.914999999999916 | 1.359 | 1.449 | 1.551 |
| 0.919999999999916 | 1.363 | 1.454 | 1.557 |
| 0.924999999999916 | 1.367 | 1.459 | 1.564 |
| 0.929999999999916 | 1.371 | 1.465 | 1.571 |
| 0.934999999999916 | 1.375 | 1.47 | 1.577 |
| 0.939999999999916 | 1.38 | 1.475 | 1.584 |
| 0.944999999999916 | 1.384 | 1.481 | 1.591 |
| 0.949999999999916 | 1.388 | 1.486 | 1.598 |
| 0.954999999999916 | 1.393 | 1.492 | 1.604 |
| 0.959999999999916 | 1.397 | 1.497 | 1.611 |
| 0.964999999999916 | 1.401 | 1.503 | 1.618 |
| 0.969999999999916 | 1.406 | 1.509 | 1.625 |
| 0.974999999999916 | 1.41 | 1.514 | 1.632 |
| 0.979999999999916 | 1.415 | 1.52 | 1.64 |
| 0.984999999999916 | 1.419 | 1.526 | 1.647 |
| 0.989999999999916 | 1.424 | 1.531 | 1.654 |
| 0.994999999999916 | 1.428 | 1.537 | 1.661 |
| 0.999999999999916 | 1.433 | 1.543 | 1.669 |
| 1.004999999999916 | 1.438 | 1.549 | 1.676 |
| 1.009999999999916 | 1.442 | 1.555 | 1.683 |
| 1.014999999999916 | 1.447 | 1.561 | 1.691 |
| 1.019999999999916 | 1.452 | 1.567 | 1.698 |
| 1.024999999999916 | 1.457 | 1.573 | 1.706 |
| 1.029999999999916 | 1.461 | 1.579 | 1.714 |
| 1.034999999999916 | 1.466 | 1.585 | 1.721 |
| 1.039999999999915 | 1.471 | 1.591 | 1.729 |
| 1.044999999999915 | 1.476 | 1.598 | 1.737 |
| 1.049999999999915 | 1.481 | 1.604 | 1.745 |
| 1.054999999999915 | 1.486 | 1.61 | 1.752 |
| 1.059999999999915 | 1.491 | 1.616 | 1.76 |
| 1.064999999999915 | 1.496 | 1.623 | 1.768 |
| 1.069999999999915 | 1.501 | 1.629 | 1.776 |
| 1.074999999999915 | 1.506 | 1.636 | 1.785 |
| 1.079999999999915 | 1.511 | 1.642 | 1.793 |
| 1.084999999999914 | 1.516 | 1.649 | 1.801 |
| 1.089999999999914 | 1.521 | 1.655 | 1.809 |
| 1.094999999999914 | 1.526 | 1.662 | 1.817 |
| 1.099999999999914 | 1.531 | 1.669 | 1.826 |
| 1.104999999999914 | 1.537 | 1.675 | 1.834 |
| 1.109999999999914 | 1.542 | 1.682 | 1.843 |
| 1.114999999999914 | 1.547 | 1.689 | 1.851 |
| 1.119999999999914 | 1.553 | 1.696 | 1.86 |
| 1.124999999999914 | 1.558 | 1.702 | 1.869 |
| 1.129999999999914 | 1.563 | 1.709 | 1.877 |
| 1.134999999999913 | 1.569 | 1.716 | 1.886 |
| 1.139999999999913 | 1.574 | 1.723 | 1.895 |
| 1.144999999999913 | 1.58 | 1.73 | 1.904 |
| 1.149999999999913 | 1.585 | 1.737 | 1.913 |
| 1.154999999999913 | 1.591 | 1.745 | 1.922 |
| 1.159999999999913 | 1.596 | 1.752 | 1.931 |
| 1.164999999999913 | 1.602 | 1.759 | 1.94 |
| 1.169999999999913 | 1.608 | 1.766 | 1.949 |
| 1.174999999999913 | 1.613 | 1.773 | 1.958 |
| 1.179999999999912 | 1.619 | 1.781 | 1.968 |
| 1.184999999999912 | 1.625 | 1.788 | 1.977 |
| 1.189999999999912 | 1.63 | 1.796 | 1.986 |
| 1.194999999999912 | 1.636 | 1.803 | 1.996 |
| 1.199999999999912 | 1.642 | 1.811 | 2.005 |
| 1.204999999999912 | 1.648 | 1.818 | 2.015 |
| 1.209999999999912 | 1.654 | 1.826 | 2.025 |
| 1.214999999999912 | 1.66 | 1.834 | 2.034 |
| 1.219999999999912 | 1.666 | 1.841 | 2.044 |
| 1.224999999999911 | 1.672 | 1.849 | 2.054 |
| 1.229999999999911 | 1.678 | 1.857 | 2.064 |
| 1.234999999999911 | 1.684 | 1.865 | 2.074 |
| 1.239999999999911 | 1.69 | 1.872 | 2.084 |
| 1.244999999999911 | 1.696 | 1.88 | 2.094 |
| 1.249999999999911 | 1.702 | 1.888 | 2.104 |
| 1.254999999999911 | 1.709 | 1.896 | 2.114 |
| 1.259999999999911 | 1.715 | 1.905 | 2.124 |
| 1.264999999999911 | 1.721 | 1.913 | 2.135 |
| 1.269999999999911 | 1.728 | 1.921 | 2.145 |
| 1.27499999999991 | 1.734 | 1.929 | 2.156 |
| 1.27999999999991 | 1.74 | 1.937 | 2.166 |
| 1.28499999999991 | 1.747 | 1.946 | 2.177 |
| 1.28999999999991 | 1.753 | 1.954 | 2.187 |
| 1.29499999999991 | 1.76 | 1.962 | 2.198 |
| 1.29999999999991 | 1.766 | 1.971 | 2.209 |
| 1.30499999999991 | 1.773 | 1.979 | 2.22 |
| 1.30999999999991 | 1.779 | 1.988 | 2.231 |
| 1.31499999999991 | 1.786 | 1.997 | 2.242 |
| 1.319999999999909 | 1.793 | 2.005 | 2.253 |
| 1.324999999999909 | 1.799 | 2.014 | 2.264 |
| 1.329999999999909 | 1.806 | 2.023 | 2.275 |
| 1.334999999999909 | 1.813 | 2.032 | 2.286 |
| 1.339999999999909 | 1.82 | 2.04 | 2.298 |
| 1.344999999999909 | 1.827 | 2.049 | 2.309 |
| 1.349999999999909 | 1.834 | 2.058 | 2.321 |
| 1.354999999999909 | 1.84 | 2.067 | 2.332 |
| 1.359999999999909 | 1.847 | 2.076 | 2.344 |
| 1.364999999999908 | 1.854 | 2.086 | 2.356 |
| 1.369999999999908 | 1.861 | 2.095 | 2.367 |
| 1.374999999999908 | 1.869 | 2.104 | 2.379 |
| 1.379999999999908 | 1.876 | 2.113 | 2.391 |
| 1.384999999999908 | 1.883 | 2.123 | 2.403 |
| 1.389999999999908 | 1.89 | 2.132 | 2.415 |
| 1.394999999999908 | 1.897 | 2.141 | 2.427 |
| 1.399999999999908 | 1.905 | 2.151 | 2.439 |
| 1.404999999999908 | 1.912 | 2.16 | 2.452 |
| 1.409999999999908 | 1.919 | 2.17 | 2.464 |
| 1.414999999999907 | 1.927 | 2.18 | 2.477 |
| 1.419999999999907 | 1.934 | 2.189 | 2.489 |
| 1.424999999999907 | 1.941 | 2.199 | 2.502 |
| 1.429999999999907 | 1.949 | 2.209 | 2.514 |
| 1.434999999999907 | 1.957 | 2.219 | 2.527 |
| 1.439999999999907 | 1.964 | 2.229 | 2.54 |
| 1.444999999999907 | 1.972 | 2.239 | 2.553 |
| 1.449999999999907 | 1.979 | 2.249 | 2.566 |
| 1.454999999999907 | 1.987 | 2.259 | 2.579 |
| 1.459999999999906 | 1.995 | 2.269 | 2.592 |
| 1.464999999999906 | 2.003 | 2.279 | 2.605 |
| 1.469999999999906 | 2.011 | 2.29 | 2.618 |
| 1.474999999999906 | 2.018 | 2.3 | 2.632 |
| 1.479999999999906 | 2.026 | 2.31 | 2.645 |
| 1.484999999999906 | 2.034 | 2.321 | 2.659 |
| 1.489999999999906 | 2.042 | 2.331 | 2.672 |
| 1.494999999999906 | 2.05 | 2.342 | 2.686 |
| 1.499999999999906 | 2.058 | 2.352 | 2.7 |
| 1.504999999999906 | 2.066 | 2.363 | 2.713 |
| 1.509999999999905 | 2.075 | 2.374 | 2.727 |
| 1.514999999999905 | 2.083 | 2.385 | 2.741 |
| 1.519999999999905 | 2.091 | 2.395 | 2.755 |
| 1.524999999999905 | 2.099 | 2.406 | 2.769 |
| 1.529999999999905 | 2.108 | 2.417 | 2.784 |
| 1.534999999999905 | 2.116 | 2.428 | 2.798 |
| 1.539999999999905 | 2.124 | 2.439 | 2.812 |
| 1.544999999999905 | 2.133 | 2.451 | 2.827 |
| 1.549999999999905 | 2.141 | 2.462 | 2.842 |
| 1.554999999999904 | 2.15 | 2.473 | 2.856 |
| 1.559999999999904 | 2.159 | 2.484 | 2.871 |
| 1.564999999999904 | 2.167 | 2.496 | 2.886 |
| 1.569999999999904 | 2.176 | 2.507 | 2.901 |
| 1.574999999999904 | 2.185 | 2.519 | 2.916 |
| 1.579999999999904 | 2.193 | 2.53 | 2.931 |
| 1.584999999999904 | 2.202 | 2.542 | 2.946 |
| 1.589999999999904 | 2.211 | 2.554 | 2.961 |
| 1.594999999999904 | 2.22 | 2.566 | 2.977 |
| 1.599999999999903 | 2.229 | 2.577 | 2.992 |
| 1.604999999999903 | 2.238 | 2.589 | 3.008 |
| 1.609999999999903 | 2.247 | 2.601 | 3.023 |
| 1.614999999999903 | 2.256 | 2.613 | 3.039 |
| 1.619999999999903 | 2.265 | 2.625 | 3.055 |
| 1.624999999999903 | 2.274 | 2.638 | 3.071 |
| 1.629999999999903 | 2.283 | 2.65 | 3.087 |
| 1.634999999999903 | 2.293 | 2.662 | 3.103 |
| 1.639999999999903 | 2.302 | 2.675 | 3.119 |
| 1.644999999999902 | 2.311 | 2.687 | 3.136 |
| 1.649999999999902 | 2.321 | 2.7 | 3.152 |
| 1.654999999999902 | 2.33 | 2.712 | 3.168 |
| 1.659999999999902 | 2.34 | 2.725 | 3.185 |
| 1.664999999999902 | 2.349 | 2.737 | 3.202 |
| 1.669999999999902 | 2.359 | 2.75 | 3.218 |
| 1.674999999999902 | 2.368 | 2.763 | 3.235 |
| 1.679999999999902 | 2.378 | 2.776 | 3.252 |
| 1.684999999999902 | 2.388 | 2.789 | 3.269 |
| 1.689999999999901 | 2.398 | 2.802 | 3.287 |
| 1.694999999999901 | 2.407 | 2.815 | 3.304 |
| 1.699999999999901 | 2.417 | 2.828 | 3.321 |
| 1.704999999999901 | 2.427 | 2.842 | 3.339 |
| 1.709999999999901 | 2.437 | 2.855 | 3.356 |
| 1.714999999999901 | 2.447 | 2.868 | 3.374 |
| 1.719999999999901 | 2.457 | 2.882 | 3.392 |
| 1.724999999999901 | 2.467 | 2.895 | 3.41 |
| 1.729999999999901 | 2.478 | 2.909 | 3.428 |
| 1.734999999999901 | 2.488 | 2.923 | 3.446 |
| 1.7399999999999 | 2.498 | 2.936 | 3.464 |
| 1.7449999999999 | 2.508 | 2.95 | 3.482 |
| 1.7499999999999 | 2.519 | 2.964 | 3.501 |
| 1.7549999999999 | 2.529 | 2.978 | 3.519 |
| 1.7599999999999 | 2.54 | 2.992 | 3.538 |
| 1.7649999999999 | 2.55 | 3.006 | 3.556 |
| 1.7699999999999 | 2.561 | 3.021 | 3.575 |
| 1.7749999999999 | 2.572 | 3.035 | 3.594 |
| 1.7799999999999 | 2.582 | 3.049 | 3.613 |
| 1.784999999999899 | 2.593 | 3.064 | 3.632 |
| 1.789999999999899 | 2.604 | 3.078 | 3.652 |
| 1.794999999999899 | 2.615 | 3.093 | 3.671 |
| 1.799999999999899 | 2.625 | 3.107 | 3.69 |
| 1.804999999999899 | 2.636 | 3.122 | 3.71 |
| 1.809999999999899 | 2.647 | 3.137 | 3.73 |
| 1.814999999999899 | 2.659 | 3.152 | 3.75 |
| 1.819999999999899 | 2.67 | 3.167 | 3.769 |
| 1.824999999999899 | 2.681 | 3.182 | 3.79 |
| 1.829999999999899 | 2.692 | 3.197 | 3.81 |
| 1.834999999999898 | 2.703 | 3.212 | 3.83 |
| 1.839999999999898 | 2.715 | 3.228 | 3.85 |
| 1.844999999999898 | 2.726 | 3.243 | 3.871 |
| 1.849999999999898 | 2.737 | 3.259 | 3.891 |
| 1.854999999999898 | 2.749 | 3.274 | 3.912 |
| 1.859999999999898 | 2.76 | 3.29 | 3.933 |
| 1.864999999999898 | 2.772 | 3.305 | 3.954 |
| 1.869999999999898 | 2.784 | 3.321 | 3.975 |
| 1.874999999999898 | 2.795 | 3.337 | 3.996 |
| 1.879999999999897 | 2.807 | 3.353 | 4.018 |
| 1.884999999999897 | 2.819 | 3.369 | 4.039 |
| 1.889999999999897 | 2.831 | 3.385 | 4.061 |
| 1.894999999999897 | 2.843 | 3.401 | 4.082 |
| 1.899999999999897 | 2.855 | 3.418 | 4.104 |
| 1.904999999999897 | 2.867 | 3.434 | 4.126 |
| 1.909999999999897 | 2.879 | 3.451 | 4.148 |
| 1.914999999999897 | 2.891 | 3.467 | 4.171 |
| 1.919999999999897 | 2.904 | 3.484 | 4.193 |
| 1.924999999999897 | 2.916 | 3.501 | 4.215 |
| 1.929999999999896 | 2.928 | 3.517 | 4.238 |
| 1.934999999999896 | 2.941 | 3.534 | 4.261 |
| 1.939999999999896 | 2.953 | 3.551 | 4.283 |
| 1.944999999999896 | 2.966 | 3.568 | 4.306 |
| 1.949999999999896 | 2.978 | 3.585 | 4.33 |
| 1.954999999999896 | 2.991 | 3.603 | 4.353 |
| 1.959999999999896 | 3.004 | 3.62 | 4.376 |
| 1.964999999999896 | 3.016 | 3.638 | 4.4 |
| 1.969999999999896 | 3.029 | 3.655 | 4.423 |
| 1.974999999999895 | 3.042 | 3.673 | 4.447 |
| 1.979999999999895 | 3.055 | 3.69 | 4.471 |
| 1.984999999999895 | 3.068 | 3.708 | 4.495 |
| 1.989999999999895 | 3.081 | 3.726 | 4.519 |
| 1.994999999999895 | 3.094 | 3.744 | 4.543 |
| 1.999999999999895 | 3.107 | 3.762 | 4.568 |
| 2.004999999999895 | 3.121 | 3.78 | 4.592 |
| 2.009999999999895 | 3.134 | 3.799 | 4.617 |
| 2.014999999999895 | 3.147 | 3.817 | 4.642 |
| 2.019999999999895 | 3.161 | 3.835 | 4.667 |
| 2.024999999999895 | 3.174 | 3.854 | 4.692 |
| 2.029999999999895 | 3.188 | 3.873 | 4.718 |
| 2.034999999999894 | 3.202 | 3.891 | 4.743 |
| 2.039999999999894 | 3.215 | 3.91 | 4.769 |
| 2.044999999999894 | 3.229 | 3.929 | 4.794 |
| 2.049999999999894 | 3.243 | 3.948 | 4.82 |
| 2.054999999999894 | 3.257 | 3.967 | 4.846 |
| 2.059999999999894 | 3.271 | 3.987 | 4.872 |
| 2.064999999999894 | 3.285 | 4.006 | 4.899 |
| 2.069999999999894 | 3.299 | 4.026 | 4.925 |
| 2.074999999999894 | 3.313 | 4.045 | 4.952 |
| 2.079999999999893 | 3.328 | 4.065 | 4.978 |
| 2.084999999999893 | 3.342 | 4.084 | 5.005 |
| 2.089999999999893 | 3.356 | 4.104 | 5.032 |
| 2.094999999999893 | 3.371 | 4.124 | 5.059 |
| 2.099999999999893 | 3.385 | 4.144 | 5.087 |
| 2.104999999999893 | 3.4 | 4.164 | 5.114 |
| 2.109999999999893 | 3.414 | 4.185 | 5.142 |
| 2.114999999999893 | 3.429 | 4.205 | 5.17 |
| 2.119999999999893 | 3.444 | 4.226 | 5.198 |
| 2.124999999999893 | 3.459 | 4.246 | 5.226 |
| 2.129999999999892 | 3.474 | 4.267 | 5.254 |
| 2.134999999999892 | 3.489 | 4.288 | 5.283 |
| 2.139999999999892 | 3.504 | 4.309 | 5.311 |
| 2.144999999999892 | 3.519 | 4.33 | 5.34 |
| 2.149999999999892 | 3.534 | 4.351 | 5.369 |
| 2.154999999999892 | 3.55 | 4.372 | 5.398 |
| 2.159999999999892 | 3.565 | 4.393 | 5.427 |
| 2.164999999999892 | 3.58 | 4.415 | 5.457 |
| 2.169999999999892 | 3.596 | 4.436 | 5.486 |
| 2.174999999999891 | 3.611 | 4.458 | 5.516 |
| 2.179999999999891 | 3.627 | 4.48 | 5.546 |
| 2.184999999999891 | 3.643 | 4.502 | 5.576 |
| 2.189999999999891 | 3.659 | 4.524 | 5.606 |
| 2.194999999999891 | 3.674 | 4.546 | 5.637 |
| 2.199999999999891 | 3.69 | 4.568 | 5.667 |
| 2.204999999999891 | 3.706 | 4.59 | 5.698 |
| 2.209999999999891 | 3.723 | 4.613 | 5.729 |
| 2.214999999999891 | 3.739 | 4.635 | 5.76 |
| 2.21999999999989 | 3.755 | 4.658 | 5.791 |
| 2.22499999999989 | 3.771 | 4.681 | 5.823 |
| 2.22999999999989 | 3.788 | 4.704 | 5.855 |
| 2.23499999999989 | 3.804 | 4.727 | 5.886 |
| 2.23999999999989 | 3.821 | 4.75 | 5.918 |
| 2.24499999999989 | 3.837 | 4.773 | 5.951 |
| 2.24999999999989 | 3.854 | 4.797 | 5.983 |
| 2.25499999999989 | 3.871 | 4.82 | 6.015 |
| 2.25999999999989 | 3.888 | 4.844 | 6.048 |
| 2.26499999999989 | 3.905 | 4.867 | 6.081 |
| 2.269999999999889 | 3.922 | 4.891 | 6.114 |
| 2.274999999999889 | 3.939 | 4.915 | 6.147 |
| 2.279999999999889 | 3.956 | 4.939 | 6.181 |
| 2.284999999999889 | 3.973 | 4.964 | 6.215 |
| 2.289999999999889 | 3.991 | 4.988 | 6.248 |
| 2.294999999999889 | 4.008 | 5.013 | 6.282 |
| 2.299999999999889 | 4.026 | 5.037 | 6.317 |
| 2.304999999999889 | 4.043 | 5.062 | 6.351 |
| 2.309999999999889 | 4.061 | 5.087 | 6.386 |
| 2.314999999999888 | 4.079 | 5.112 | 6.42 |
| 2.319999999999888 | 4.096 | 5.137 | 6.455 |
| 2.324999999999888 | 4.114 | 5.162 | 6.491 |
| 2.329999999999888 | 4.132 | 5.188 | 6.526 |
| 2.334999999999888 | 4.15 | 5.213 | 6.561 |
| 2.339999999999888 | 4.169 | 5.239 | 6.597 |
| 2.344999999999888 | 4.187 | 5.265 | 6.633 |
| 2.349999999999888 | 4.205 | 5.29 | 6.669 |
| 2.354999999999888 | 4.224 | 5.317 | 6.706 |
| 2.359999999999887 | 4.242 | 5.343 | 6.742 |
| 2.364999999999887 | 4.261 | 5.369 | 6.779 |
| 2.369999999999887 | 4.279 | 5.395 | 6.816 |
| 2.374999999999887 | 4.298 | 5.422 | 6.853 |
| 2.379999999999887 | 4.317 | 5.449 | 6.891 |
| 2.384999999999887 | 4.336 | 5.476 | 6.928 |
| 2.389999999999887 | 4.355 | 5.503 | 6.966 |
| 2.394999999999887 | 4.374 | 5.53 | 7.004 |
| 2.399999999999887 | 4.393 | 5.557 | 7.042 |
| 2.404999999999887 | 4.413 | 5.584 | 7.081 |
| 2.409999999999886 | 4.432 | 5.612 | 7.119 |
| 2.414999999999886 | 4.451 | 5.64 | 7.158 |
| 2.419999999999886 | 4.471 | 5.667 | 7.197 |
| 2.424999999999886 | 4.491 | 5.695 | 7.237 |
| 2.429999999999886 | 4.51 | 5.723 | 7.276 |
| 2.434999999999886 | 4.53 | 5.752 | 7.316 |
| 2.439999999999886 | 4.55 | 5.78 | 7.356 |
| 2.444999999999886 | 4.57 | 5.809 | 7.396 |
| 2.449999999999886 | 4.59 | 5.837 | 7.437 |
| 2.454999999999885 | 4.61 | 5.866 | 7.477 |
| 2.459999999999885 | 4.631 | 5.895 | 7.518 |
| 2.464999999999885 | 4.651 | 5.924 | 7.559 |
| 2.469999999999885 | 4.672 | 5.954 | 7.6 |
| 2.474999999999885 | 4.692 | 5.983 | 7.642 |
| 2.479999999999885 | 4.713 | 6.013 | 7.684 |
| 2.484999999999885 | 4.734 | 6.042 | 7.726 |
| 2.489999999999885 | 4.755 | 6.072 | 7.768 |
| 2.494999999999885 | 4.776 | 6.102 | 7.811 |
| 2.499999999999884 | 4.797 | 6.132 | 7.853 |
| 2.504999999999884 | 4.818 | 6.163 | 7.896 |
| 2.509999999999884 | 4.839 | 6.193 | 7.939 |
| 2.514999999999884 | 4.86 | 6.224 | 7.983 |
| 2.519999999999884 | 4.882 | 6.255 | 8.027 |
| 2.524999999999884 | 4.903 | 6.285 | 8.07 |
| 2.529999999999884 | 4.925 | 6.317 | 8.115 |
| 2.534999999999884 | 4.947 | 6.348 | 8.159 |
| 2.539999999999884 | 4.969 | 6.379 | 8.204 |
| 2.544999999999884 | 4.991 | 6.411 | 8.249 |
| 2.549999999999883 | 5.013 | 6.443 | 8.294 |
| 2.554999999999883 | 5.035 | 6.474 | 8.339 |
| 2.559999999999883 | 5.057 | 6.507 | 8.385 |
| 2.564999999999883 | 5.079 | 6.539 | 8.431 |
| 2.569999999999883 | 5.102 | 6.571 | 8.477 |
| 2.574999999999883 | 5.124 | 6.604 | 8.523 |
| 2.579999999999883 | 5.147 | 6.636 | 8.57 |
| 2.584999999999883 | 5.17 | 6.669 | 8.617 |
| 2.589999999999883 | 5.193 | 6.702 | 8.664 |
| 2.594999999999882 | 5.216 | 6.736 | 8.712 |
| 2.599999999999882 | 5.239 | 6.769 | 8.759 |
| 2.604999999999882 | 5.262 | 6.803 | 8.807 |
| 2.609999999999882 | 5.285 | 6.836 | 8.856 |
| 2.614999999999882 | 5.309 | 6.87 | 8.904 |
| 2.619999999999882 | 5.332 | 6.904 | 8.953 |
| 2.624999999999882 | 5.356 | 6.939 | 9.002 |
| 2.629999999999882 | 5.38 | 6.973 | 9.051 |
| 2.634999999999882 | 5.403 | 7.008 | 9.101 |
| 2.639999999999881 | 5.427 | 7.042 | 9.151 |
| 2.644999999999881 | 5.451 | 7.077 | 9.201 |
| 2.649999999999881 | 5.476 | 7.112 | 9.252 |
| 2.654999999999881 | 5.5 | 7.148 | 9.302 |
| 2.659999999999881 | 5.524 | 7.183 | 9.353 |
| 2.664999999999881 | 5.549 | 7.219 | 9.405 |
| 2.669999999999881 | 5.573 | 7.255 | 9.456 |
| 2.674999999999881 | 5.598 | 7.291 | 9.508 |
| 2.679999999999881 | 5.623 | 7.327 | 9.56 |
| 2.68499999999988 | 5.648 | 7.363 | 9.613 |
| 2.68999999999988 | 5.673 | 7.4 | 9.665 |
| 2.69499999999988 | 5.698 | 7.437 | 9.718 |
| 2.69999999999988 | 5.723 | 7.473 | 9.772 |
| 2.70499999999988 | 5.749 | 7.511 | 9.825 |
| 2.70999999999988 | 5.774 | 7.548 | 9.879 |
| 2.71499999999988 | 5.8 | 7.585 | 9.933 |
| 2.71999999999988 | 5.826 | 7.623 | 9.988 |
| 2.72499999999988 | 5.852 | 7.661 | 10.043 |
| 2.72999999999988 | 5.878 | 7.699 | 10.098 |
| 2.734999999999879 | 5.904 | 7.737 | 10.153 |
| 2.739999999999879 | 5.93 | 7.776 | 10.209 |
| 2.744999999999879 | 5.956 | 7.814 | 10.265 |
| 2.749999999999879 | 5.983 | 7.853 | 10.321 |
| 2.754999999999879 | 6.01 | 7.892 | 10.378 |
| 2.759999999999879 | 6.036 | 7.932 | 10.435 |
| 2.764999999999879 | 6.063 | 7.971 | 10.492 |
| 2.769999999999879 | 6.09 | 8.011 | 10.55 |
| 2.774999999999879 | 6.117 | 8.05 | 10.608 |
| 2.779999999999878 | 6.144 | 8.091 | 10.666 |
| 2.784999999999878 | 6.172 | 8.131 | 10.725 |
| 2.789999999999878 | 6.199 | 8.171 | 10.783 |
| 2.794999999999878 | 6.227 | 8.212 | 10.843 |
| 2.799999999999878 | 6.255 | 8.253 | 10.902 |
| 2.804999999999878 | 6.282 | 8.294 | 10.962 |
| 2.809999999999878 | 6.31 | 8.335 | 11.022 |
| 2.814999999999878 | 6.338 | 8.377 | 11.083 |
| 2.819999999999878 | 6.367 | 8.418 | 11.144 |
| 2.824999999999878 | 6.395 | 8.46 | 11.205 |
| 2.829999999999877 | 6.424 | 8.502 | 11.266 |
| 2.834999999999877 | 6.452 | 8.545 | 11.328 |
| 2.839999999999877 | 6.481 | 8.587 | 11.391 |
| 2.844999999999877 | 6.51 | 8.63 | 11.453 |
| 2.849999999999877 | 6.539 | 8.673 | 11.516 |
| 2.854999999999877 | 6.568 | 8.716 | 11.579 |
| 2.859999999999877 | 6.597 | 8.759 | 11.643 |
| 2.864999999999877 | 6.627 | 8.803 | 11.707 |
| 2.869999999999877 | 6.656 | 8.847 | 11.771 |
| 2.874999999999876 | 6.686 | 8.891 | 11.836 |
| 2.879999999999876 | 6.716 | 8.935 | 11.901 |
| 2.884999999999876 | 6.746 | 8.98 | 11.966 |
| 2.889999999999876 | 6.776 | 9.024 | 12.032 |
| 2.894999999999876 | 6.806 | 9.069 | 12.098 |
| 2.899999999999876 | 6.836 | 9.115 | 12.165 |
| 2.904999999999876 | 6.867 | 9.16 | 12.232 |
| 2.909999999999876 | 6.897 | 9.206 | 12.299 |
| 2.914999999999876 | 6.928 | 9.252 | 12.367 |
| 2.919999999999876 | 6.959 | 9.298 | 12.434 |
| 2.924999999999875 | 6.99 | 9.344 | 12.503 |
| 2.929999999999875 | 7.021 | 9.391 | 12.572 |
| 2.934999999999875 | 7.053 | 9.437 | 12.641 |
| 2.939999999999875 | 7.084 | 9.484 | 12.71 |
| 2.944999999999875 | 7.116 | 9.532 | 12.78 |
| 2.949999999999875 | 7.148 | 9.579 | 12.85 |
| 2.954999999999875 | 7.18 | 9.627 | 12.921 |
| 2.959999999999875 | 7.212 | 9.675 | 12.992 |
| 2.964999999999875 | 7.244 | 9.723 | 13.063 |
| 2.969999999999874 | 7.276 | 9.772 | 13.135 |
| 2.974999999999874 | 7.309 | 9.82 | 13.208 |
| 2.979999999999874 | 7.341 | 9.869 | 13.28 |
| 2.984999999999874 | 7.374 | 9.919 | 13.353 |
| 2.989999999999874 | 7.407 | 9.968 | 13.427 |
| 2.994999999999874 | 7.44 | 10.018 | 13.501 |
| 2.999999999999874 | 7.473 | 10.068 | 13.575 |
| 3.004999999999874 | 7.507 | 10.118 | 13.649 |
| 3.009999999999874 | 7.54 | 10.168 | 13.725 |
| 3.014999999999874 | 7.574 | 10.219 | 13.8 |
| 3.019999999999873 | 7.608 | 10.27 | 13.876 |
| 3.024999999999873 | 7.642 | 10.321 | 13.952 |
| 3.029999999999873 | 7.676 | 10.373 | 14.029 |
| 3.034999999999873 | 7.711 | 10.425 | 14.106 |
| 3.039999999999873 | 7.745 | 10.477 | 14.184 |
| 3.044999999999873 | 7.78 | 10.529 | 14.262 |
| 3.049999999999873 | 7.814 | 10.581 | 14.34 |
| 3.054999999999873 | 7.849 | 10.634 | 14.419 |
| 3.059999999999873 | 7.885 | 10.687 | 14.498 |
| 3.064999999999872 | 7.92 | 10.741 | 14.578 |
| 3.069999999999872 | 7.955 | 10.794 | 14.658 |
| 3.074999999999872 | 7.991 | 10.848 | 14.739 |
| 3.079999999999872 | 8.027 | 10.902 | 14.82 |
| 3.084999999999872 | 8.062 | 10.957 | 14.902 |
| 3.089999999999872 | 8.099 | 11.011 | 14.984 |
| 3.094999999999872 | 8.135 | 11.066 | 15.066 |
| 3.099999999999872 | 8.171 | 11.122 | 15.149 |
| 3.104999999999872 | 8.208 | 11.177 | 15.233 |
| 3.109999999999872 | 8.245 | 11.233 | 15.316 |
| 3.114999999999871 | 8.281 | 11.289 | 15.401 |
| 3.119999999999871 | 8.319 | 11.345 | 15.485 |
| 3.124999999999871 | 8.356 | 11.402 | 15.571 |
| 3.129999999999871 | 8.393 | 11.459 | 15.656 |
| 3.134999999999871 | 8.431 | 11.516 | 15.742 |
| 3.139999999999871 | 8.469 | 11.574 | 15.829 |
| 3.144999999999871 | 8.506 | 11.631 | 15.916 |
| 3.149999999999871 | 8.545 | 11.689 | 16.004 |
| 3.154999999999871 | 8.583 | 11.748 | 16.092 |
| 3.15999999999987 | 8.621 | 11.807 | 16.181 |
| 3.16499999999987 | 8.66 | 11.865 | 16.27 |
| 3.16999999999987 | 8.699 | 11.925 | 16.359 |
| 3.17499999999987 | 8.738 | 11.984 | 16.449 |
| 3.17999999999987 | 8.777 | 12.044 | 16.54 |
| 3.18499999999987 | 8.816 | 12.104 | 16.631 |
| 3.18999999999987 | 8.856 | 12.165 | 16.722 |
| 3.19499999999987 | 8.895 | 12.226 | 16.814 |
| 3.19999999999987 | 8.935 | 12.287 | 16.907 |
| 3.204999999999869 | 8.975 | 12.348 | 17 |
| 3.209999999999869 | 9.015 | 12.41 | 17.094 |
| 3.214999999999869 | 9.056 | 12.472 | 17.188 |
| 3.219999999999869 | 9.096 | 12.534 | 17.282 |
| 3.224999999999869 | 9.137 | 12.597 | 17.378 |
| 3.229999999999869 | 9.178 | 12.66 | 17.473 |
| 3.234999999999869 | 9.219 | 12.723 | 17.569 |
| 3.239999999999869 | 9.261 | 12.786 | 17.666 |
| 3.244999999999869 | 9.302 | 12.85 | 17.764 |
| 3.249999999999869 | 9.344 | 12.915 | 17.861 |
| 3.254999999999868 | 9.386 | 12.979 | 17.96 |
| 3.259999999999868 | 9.428 | 13.044 | 18.059 |
| 3.264999999999868 | 9.47 | 13.109 | 18.158 |
| 3.269999999999868 | 9.513 | 13.175 | 18.258 |
| 3.274999999999868 | 9.555 | 13.241 | 18.359 |
| 3.279999999999868 | 9.598 | 13.307 | 18.46 |
| 3.284999999999868 | 9.641 | 13.373 | 18.561 |
| 3.289999999999868 | 9.685 | 13.44 | 18.664 |
| 3.294999999999868 | 9.728 | 13.507 | 18.766 |
| 3.299999999999867 | 9.772 | 13.575 | 18.87 |
| 3.304999999999867 | 9.815 | 13.643 | 18.974 |
| 3.309999999999867 | 9.859 | 13.711 | 19.078 |
| 3.314999999999867 | 9.904 | 13.779 | 19.183 |
| 3.319999999999867 | 9.948 | 13.848 | 19.289 |
| 3.324999999999867 | 9.993 | 13.917 | 19.395 |
| 3.329999999999867 | 10.038 | 13.987 | 19.502 |
| 3.334999999999867 | 10.083 | 14.057 | 19.609 |
| 3.339999999999867 | 10.128 | 14.127 | 19.717 |
| 3.344999999999866 | 10.173 | 14.198 | 19.826 |
| 3.349999999999866 | 10.219 | 14.269 | 19.935 |
| 3.354999999999866 | 10.265 | 14.34 | 20.045 |
| 3.359999999999866 | 10.311 | 14.412 | 20.155 |
| 3.364999999999866 | 10.357 | 14.484 | 20.266 |
| 3.369999999999866 | 10.404 | 14.556 | 20.378 |
| 3.374999999999866 | 10.451 | 14.629 | 20.49 |
| 3.379999999999866 | 10.497 | 14.702 | 20.603 |
| 3.384999999999866 | 10.545 | 14.776 | 20.717 |
| 3.389999999999866 | 10.592 | 14.85 | 20.831 |
| 3.394999999999865 | 10.639 | 14.924 | 20.945 |
| 3.399999999999865 | 10.687 | 14.999 | 21.061 |
| 3.404999999999865 | 10.735 | 15.074 | 21.177 |
| 3.409999999999865 | 10.783 | 15.149 | 21.294 |
| 3.414999999999865 | 10.832 | 15.225 | 21.411 |
| 3.419999999999865 | 10.88 | 15.301 | 21.529 |
| 3.424999999999865 | 10.929 | 15.378 | 21.647 |
| 3.429999999999865 | 10.978 | 15.455 | 21.767 |
| 3.434999999999865 | 11.028 | 15.532 | 21.887 |
| 3.439999999999864 | 11.077 | 15.61 | 22.007 |
| 3.444999999999864 | 11.127 | 15.688 | 22.128 |
| 3.449999999999864 | 11.177 | 15.766 | 22.25 |
| 3.454999999999864 | 11.227 | 15.845 | 22.373 |
| 3.459999999999864 | 11.278 | 15.924 | 22.496 |
| 3.464999999999864 | 11.328 | 16.004 | 22.62 |
| 3.469999999999864 | 11.379 | 16.084 | 22.745 |
| 3.474999999999864 | 11.43 | 16.164 | 22.87 |
| 3.479999999999864 | 11.482 | 16.245 | 22.996 |
| 3.484999999999864 | 11.533 | 16.327 | 23.123 |
| 3.489999999999863 | 11.585 | 16.408 | 23.25 |
| 3.494999999999863 | 11.637 | 16.49 | 23.378 |
| 3.499999999999863 | 11.689 | 16.573 | 23.507 |
| 3.504999999999863 | 11.742 | 16.656 | 23.637 |
| 3.509999999999863 | 11.795 | 16.739 | 23.767 |
| 3.514999999999863 | 11.848 | 16.823 | 23.898 |
| 3.519999999999863 | 11.901 | 16.907 | 24.03 |
| 3.524999999999863 | 11.954 | 16.992 | 24.162 |
| 3.529999999999863 | 12.008 | 17.077 | 24.295 |
| 3.534999999999862 | 12.062 | 17.162 | 24.429 |
| 3.539999999999862 | 12.116 | 17.248 | 24.564 |
| 3.544999999999862 | 12.171 | 17.334 | 24.699 |
| 3.549999999999862 | 12.226 | 17.421 | 24.835 |
| 3.554999999999862 | 12.281 | 17.508 | 24.972 |
| 3.559999999999862 | 12.336 | 17.596 | 25.11 |
| 3.564999999999862 | 12.391 | 17.684 | 25.248 |
| 3.569999999999862 | 12.447 | 17.772 | 25.387 |
| 3.574999999999862 | 12.503 | 17.861 | 25.527 |
| 3.579999999999862 | 12.559 | 17.951 | 25.668 |
| 3.584999999999861 | 12.616 | 18.041 | 25.809 |
| 3.589999999999861 | 12.672 | 18.131 | 25.951 |
| 3.594999999999861 | 12.729 | 18.222 | 26.094 |
| 3.599999999999861 | 12.786 | 18.313 | 26.238 |
| 3.604999999999861 | 12.844 | 18.404 | 26.383 |
| 3.609999999999861 | 12.902 | 18.497 | 26.528 |
| 3.614999999999861 | 12.96 | 18.589 | 26.674 |
| 3.619999999999861 | 13.018 | 18.682 | 26.821 |
| 3.62499999999986 | 13.077 | 18.776 | 26.969 |
| 3.62999999999986 | 13.135 | 18.87 | 27.118 |
| 3.63499999999986 | 13.194 | 18.964 | 27.267 |
| 3.63999999999986 | 13.254 | 19.059 | 27.418 |
| 3.64499999999986 | 13.313 | 19.154 | 27.569 |
| 3.64999999999986 | 13.373 | 19.25 | 27.721 |
| 3.65499999999986 | 13.433 | 19.347 | 27.873 |
| 3.65999999999986 | 13.494 | 19.444 | 28.027 |
| 3.66499999999986 | 13.554 | 19.541 | 28.182 |
| 3.669999999999859 | 13.615 | 19.639 | 28.337 |
| 3.674999999999859 | 13.677 | 19.737 | 28.493 |
| 3.679999999999859 | 13.738 | 19.836 | 28.65 |
| 3.684999999999859 | 13.8 | 19.935 | 28.808 |
| 3.689999999999859 | 13.862 | 20.035 | 28.967 |
| 3.694999999999859 | 13.924 | 20.135 | 29.126 |
| 3.699999999999859 | 13.987 | 20.236 | 29.287 |
| 3.704999999999859 | 14.05 | 20.337 | 29.448 |
| 3.709999999999859 | 14.113 | 20.439 | 29.611 |
| 3.714999999999859 | 14.177 | 20.541 | 29.774 |
| 3.719999999999858 | 14.24 | 20.644 | 29.938 |
| 3.724999999999858 | 14.305 | 20.748 | 30.103 |
| 3.729999999999858 | 14.369 | 20.852 | 30.269 |
| 3.734999999999858 | 14.434 | 20.956 | 30.436 |
| 3.739999999999858 | 14.498 | 21.061 | 30.604 |
| 3.744999999999858 | 14.564 | 21.166 | 30.772 |
| 3.749999999999858 | 14.629 | 21.272 | 30.942 |
| 3.754999999999858 | 14.695 | 21.379 | 31.113 |
| 3.759999999999858 | 14.761 | 21.486 | 31.284 |
| 3.764999999999857 | 14.828 | 21.593 | 31.456 |
| 3.769999999999857 | 14.894 | 21.702 | 31.63 |
| 3.774999999999857 | 14.961 | 21.81 | 31.804 |
| 3.779999999999857 | 15.029 | 21.919 | 31.98 |
| 3.784999999999857 | 15.096 | 22.029 | 32.156 |
| 3.789999999999857 | 15.164 | 22.139 | 32.333 |
| 3.794999999999857 | 15.233 | 22.25 | 32.511 |
| 3.799999999999857 | 15.301 | 22.362 | 32.691 |
| 3.804999999999857 | 15.37 | 22.474 | 32.871 |
| 3.809999999999857 | 15.439 | 22.586 | 33.052 |
| 3.814999999999856 | 15.509 | 22.699 | 33.234 |
| 3.819999999999856 | 15.578 | 22.813 | 33.417 |
| 3.824999999999856 | 15.649 | 22.927 | 33.602 |
| 3.829999999999856 | 15.719 | 23.042 | 33.787 |
| 3.834999999999856 | 15.79 | 23.158 | 33.973 |
| 3.839999999999856 | 15.861 | 23.273 | 34.16 |
| 3.844999999999856 | 15.932 | 23.39 | 34.349 |
| 3.849999999999856 | 16.004 | 23.507 | 34.538 |
| 3.854999999999856 | 16.076 | 23.625 | 34.728 |
| 3.859999999999855 | 16.148 | 23.743 | 34.92 |
| 3.864999999999855 | 16.221 | 23.862 | 35.112 |
| 3.869999999999855 | 16.294 | 23.982 | 35.306 |
| 3.874999999999855 | 16.367 | 24.102 | 35.501 |
| 3.879999999999855 | 16.441 | 24.222 | 35.696 |
| 3.884999999999855 | 16.515 | 24.344 | 35.893 |
| 3.889999999999855 | 16.589 | 24.466 | 36.091 |
| 3.894999999999855 | 16.664 | 24.588 | 36.29 |
| 3.899999999999855 | 16.739 | 24.711 | 36.49 |
| 3.904999999999855 | 16.814 | 24.835 | 36.691 |
| 3.909999999999854 | 16.89 | 24.959 | 36.894 |
| 3.914999999999854 | 16.966 | 25.085 | 37.097 |
| 3.919999999999854 | 17.043 | 25.21 | 37.301 |
| 3.924999999999854 | 17.119 | 25.336 | 37.507 |
| 3.929999999999854 | 17.196 | 25.463 | 37.714 |
| 3.934999999999854 | 17.274 | 25.591 | 37.922 |
| 3.939999999999854 | 17.352 | 25.719 | 38.131 |
| 3.944999999999854 | 17.43 | 25.848 | 38.341 |
| 3.949999999999854 | 17.508 | 25.977 | 38.553 |
| 3.954999999999853 | 17.587 | 26.107 | 38.765 |
| 3.959999999999853 | 17.666 | 26.238 | 38.979 |
| 3.964999999999853 | 17.746 | 26.37 | 39.194 |
| 3.969999999999853 | 17.826 | 26.502 | 39.41 |
| 3.974999999999853 | 17.906 | 26.634 | 39.627 |
| 3.979999999999853 | 17.987 | 26.768 | 39.846 |
| 3.984999999999853 | 18.068 | 26.902 | 40.065 |
| 3.989999999999853 | 18.149 | 27.037 | 40.286 |
| 3.994999999999853 | 18.231 | 27.172 | 40.508 |
| 3.999999999999853 | 18.313 | 27.308 | 40.732 |
| 4.004999999999852 | 18.395 | 27.445 | 40.956 |
| 4.009999999999852 | 18.478 | 27.583 | 41.182 |
| 4.014999999999852 | 18.561 | 27.721 | 41.409 |
| 4.019999999999852 | 18.645 | 27.86 | 41.637 |
| 4.024999999999852 | 18.729 | 27.999 | 41.867 |
| 4.029999999999852 | 18.813 | 28.139 | 42.098 |
| 4.034999999999852 | 18.898 | 28.28 | 42.33 |
| 4.039999999999851 | 18.983 | 28.422 | 42.563 |
| 4.044999999999852 | 19.069 | 28.564 | 42.798 |
| 4.049999999999851 | 19.154 | 28.707 | 43.034 |
| 4.054999999999851 | 19.241 | 28.851 | 43.271 |
| 4.059999999999851 | 19.327 | 28.996 | 43.51 |
| 4.064999999999851 | 19.414 | 29.141 | 43.75 |
| 4.069999999999851 | 19.502 | 29.287 | 43.991 |
| 4.074999999999851 | 19.59 | 29.434 | 44.233 |
| 4.07999999999985 | 19.678 | 29.581 | 44.477 |
| 4.084999999999851 | 19.767 | 29.729 | 44.723 |
| 4.08999999999985 | 19.856 | 29.878 | 44.969 |
| 4.094999999999851 | 19.945 | 30.028 | 45.217 |
| 4.09999999999985 | 20.035 | 30.178 | 45.466 |
| 4.10499999999985 | 20.125 | 30.33 | 45.717 |
| 4.10999999999985 | 20.216 | 30.482 | 45.969 |
| 4.11499999999985 | 20.307 | 30.634 | 46.223 |
| 4.11999999999985 | 20.398 | 30.788 | 46.478 |
| 4.12499999999985 | 20.49 | 30.942 | 46.734 |
| 4.12999999999985 | 20.583 | 31.097 | 46.991 |
| 4.13499999999985 | 20.675 | 31.253 | 47.251 |
| 4.13999999999985 | 20.768 | 31.409 | 47.511 |
| 4.144999999999849 | 20.862 | 31.567 | 47.773 |
| 4.14999999999985 | 20.956 | 31.725 | 48.037 |
| 4.154999999999849 | 21.05 | 31.884 | 48.301 |
| 4.15999999999985 | 21.145 | 32.044 | 48.568 |
| 4.164999999999849 | 21.24 | 32.204 | 48.836 |
| 4.169999999999849 | 21.336 | 32.365 | 49.105 |
| 4.174999999999849 | 21.432 | 32.528 | 49.376 |
| 4.179999999999848 | 21.529 | 32.691 | 49.648 |
| 4.184999999999849 | 21.626 | 32.854 | 49.922 |
| 4.189999999999848 | 21.723 | 33.019 | 50.197 |
| 4.194999999999848 | 21.821 | 33.184 | 50.474 |
| 4.199999999999848 | 21.919 | 33.351 | 50.752 |
| 4.204999999999848 | 22.018 | 33.518 | 51.032 |
| 4.209999999999848 | 22.117 | 33.686 | 51.313 |
| 4.214999999999848 | 22.217 | 33.854 | 51.596 |
| 4.219999999999847 | 22.317 | 34.024 | 51.881 |
| 4.224999999999848 | 22.418 | 34.195 | 52.167 |
| 4.229999999999847 | 22.519 | 34.366 | 52.454 |
| 4.234999999999847 | 22.62 | 34.538 | 52.744 |
| 4.239999999999847 | 22.722 | 34.711 | 53.034 |
| 4.244999999999847 | 22.824 | 34.885 | 53.327 |
| 4.249999999999847 | 22.927 | 35.06 | 53.621 |
| 4.254999999999847 | 23.031 | 35.236 | 53.917 |
| 4.259999999999846 | 23.134 | 35.412 | 54.214 |
| 4.264999999999847 | 23.239 | 35.589 | 54.513 |
| 4.269999999999846 | 23.343 | 35.768 | 54.813 |
| 4.274999999999846 | 23.449 | 35.947 | 55.116 |
| 4.279999999999846 | 23.554 | 36.127 | 55.42 |
| 4.284999999999846 | 23.66 | 36.308 | 55.725 |
| 4.289999999999846 | 23.767 | 36.49 | 56.033 |
| 4.294999999999846 | 23.874 | 36.673 | 56.342 |
| 4.299999999999846 | 23.982 | 36.857 | 56.652 |
| 4.304999999999846 | 24.09 | 37.041 | 56.965 |
| 4.309999999999845 | 24.198 | 37.227 | 57.279 |
| 4.314999999999846 | 24.307 | 37.413 | 57.595 |
| 4.319999999999845 | 24.417 | 37.601 | 57.912 |
| 4.324999999999846 | 24.527 | 37.789 | 58.232 |
| 4.329999999999845 | 24.637 | 37.979 | 58.553 |
| 4.334999999999845 | 24.748 | 38.169 | 58.875 |
| 4.339999999999845 | 24.86 | 38.36 | 59.2 |
| 4.344999999999845 | 24.972 | 38.553 | 59.527 |
| 4.349999999999845 | 25.085 | 38.746 | 59.855 |
| 4.354999999999845 | 25.198 | 38.94 | 60.185 |
| 4.359999999999844 | 25.311 | 39.135 | 60.517 |
| 4.364999999999845 | 25.425 | 39.331 | 60.851 |
| 4.369999999999844 | 25.54 | 39.528 | 61.186 |
| 4.374999999999844 | 25.655 | 39.726 | 61.523 |
| 4.379999999999844 | 25.77 | 39.925 | 61.863 |
| 4.384999999999844 | 25.887 | 40.125 | 62.204 |
| 4.389999999999844 | 26.003 | 40.326 | 62.547 |
| 4.394999999999844 | 26.12 | 40.528 | 62.892 |
| 4.399999999999844 | 26.238 | 40.732 | 63.239 |
| 4.404999999999844 | 26.356 | 40.936 | 63.587 |
| 4.409999999999843 | 26.475 | 41.141 | 63.938 |
| 4.414999999999844 | 26.595 | 41.347 | 64.291 |
| 4.419999999999843 | 26.714 | 41.554 | 64.645 |
| 4.424999999999843 | 26.835 | 41.762 | 65.002 |
| 4.429999999999843 | 26.956 | 41.972 | 65.36 |
| 4.434999999999843 | 27.077 | 42.182 | 65.72 |
| 4.439999999999843 | 27.199 | 42.393 | 66.083 |
| 4.444999999999843 | 27.322 | 42.606 | 66.447 |
| 4.449999999999842 | 27.445 | 42.819 | 66.814 |
| 4.454999999999843 | 27.569 | 43.034 | 67.182 |
| 4.459999999999842 | 27.693 | 43.25 | 67.553 |
| 4.464999999999843 | 27.818 | 43.466 | 67.925 |
| 4.469999999999842 | 27.943 | 43.684 | 68.3 |
| 4.474999999999842 | 28.069 | 43.903 | 68.676 |
| 4.479999999999842 | 28.196 | 44.123 | 69.055 |
| 4.484999999999842 | 28.323 | 44.344 | 69.436 |
| 4.489999999999842 | 28.45 | 44.566 | 69.819 |
| 4.494999999999842 | 28.579 | 44.79 | 70.204 |
| 4.499999999999841 | 28.707 | 45.014 | 70.591 |
| 4.504999999999842 | 28.837 | 45.24 | 70.98 |
| 4.509999999999841 | 28.967 | 45.466 | 71.372 |
| 4.514999999999842 | 29.097 | 45.694 | 71.765 |
| 4.519999999999841 | 29.229 | 45.923 | 72.161 |
| 4.524999999999841 | 29.36 | 46.153 | 72.559 |
| 4.529999999999841 | 29.493 | 46.385 | 72.959 |
| 4.534999999999841 | 29.626 | 46.617 | 73.361 |
| 4.53999999999984 | 29.759 | 46.851 | 73.766 |
| 4.544999999999841 | 29.893 | 47.086 | 74.173 |
| 4.54999999999984 | 30.028 | 47.321 | 74.582 |
| 4.554999999999841 | 30.163 | 47.559 | 74.993 |
| 4.55999999999984 | 30.299 | 47.797 | 75.407 |
| 4.564999999999841 | 30.436 | 48.037 | 75.823 |
| 4.56999999999984 | 30.573 | 48.277 | 76.241 |
| 4.57499999999984 | 30.711 | 48.519 | 76.661 |
| 4.57999999999984 | 30.849 | 48.762 | 77.084 |
| 4.58499999999984 | 30.988 | 49.007 | 77.509 |
| 4.58999999999984 | 31.128 | 49.252 | 77.936 |
| 4.59499999999984 | 31.268 | 49.499 | 78.366 |
| 4.59999999999984 | 31.409 | 49.747 | 78.798 |
| 4.60499999999984 | 31.551 | 49.996 | 79.233 |
| 4.60999999999984 | 31.693 | 50.247 | 79.67 |
| 4.614999999999839 | 31.836 | 50.499 | 80.109 |
| 4.61999999999984 | 31.98 | 50.752 | 80.551 |
| 4.624999999999839 | 32.124 | 51.006 | 80.995 |
| 4.62999999999984 | 32.269 | 51.262 | 81.442 |
| 4.634999999999839 | 32.414 | 51.519 | 81.891 |
| 4.639999999999838 | 32.56 | 51.777 | 82.343 |
| 4.644999999999839 | 32.707 | 52.036 | 82.797 |
| 4.649999999999838 | 32.854 | 52.297 | 83.253 |
| 4.654999999999839 | 33.002 | 52.559 | 83.713 |
| 4.659999999999838 | 33.151 | 52.823 | 84.174 |
| 4.664999999999838 | 33.301 | 53.088 | 84.638 |
| 4.669999999999838 | 33.451 | 53.354 | 85.105 |
| 4.674999999999838 | 33.602 | 53.621 | 85.574 |
| 4.679999999999837 | 33.753 | 53.89 | 86.046 |
| 4.684999999999838 | 33.905 | 54.16 | 86.521 |
| 4.689999999999837 | 34.058 | 54.431 | 86.998 |
| 4.694999999999838 | 34.212 | 54.704 | 87.478 |
| 4.699999999999837 | 34.366 | 54.978 | 87.96 |
| 4.704999999999837 | 34.521 | 55.254 | 88.445 |
| 4.709999999999837 | 34.676 | 55.531 | 88.933 |
| 4.714999999999837 | 34.833 | 55.809 | 89.424 |
| 4.719999999999837 | 34.99 | 56.089 | 89.917 |
| 4.724999999999837 | 35.148 | 56.37 | 90.413 |
| 4.729999999999836 | 35.306 | 56.652 | 90.911 |
| 4.734999999999836 | 35.465 | 56.936 | 91.413 |
| 4.739999999999836 | 35.625 | 57.221 | 91.917 |
| 4.744999999999836 | 35.786 | 57.508 | 92.424 |
| 4.749999999999836 | 35.947 | 57.796 | 92.933 |
| 4.754999999999836 | 36.109 | 58.086 | 93.446 |
| 4.759999999999836 | 36.272 | 58.377 | 93.961 |
| 4.764999999999836 | 36.435 | 58.67 | 94.479 |
| 4.769999999999836 | 36.6 | 58.964 | 95 |
| 4.774999999999835 | 36.765 | 59.259 | 95.524 |
| 4.779999999999835 | 36.93 | 59.556 | 96.051 |
| 4.784999999999835 | 37.097 | 59.855 | 96.581 |
| 4.789999999999835 | 37.264 | 60.155 | 97.113 |
| 4.794999999999835 | 37.432 | 60.456 | 97.649 |
| 4.799999999999835 | 37.601 | 60.759 | 98.187 |
| 4.804999999999835 | 37.77 | 61.064 | 98.729 |
| 4.809999999999835 | 37.941 | 61.37 | 99.273 |
| 4.814999999999835 | 38.112 | 61.677 | 99.821 |
| 4.819999999999835 | 38.284 | 61.987 | 100.371 |
| 4.824999999999835 | 38.456 | 62.297 | 100.925 |
| 4.829999999999834 | 38.63 | 62.609 | 101.482 |
| 4.834999999999834 | 38.804 | 62.923 | 102.041 |
| 4.839999999999834 | 38.979 | 63.239 | 102.604 |
| 4.844999999999834 | 39.155 | 63.556 | 103.17 |
| 4.849999999999834 | 39.331 | 63.874 | 103.739 |
| 4.854999999999834 | 39.508 | 64.194 | 104.311 |
| 4.859999999999834 | 39.687 | 64.516 | 104.886 |
| 4.864999999999834 | 39.865 | 64.839 | 105.465 |
| 4.869999999999834 | 40.045 | 65.164 | 106.046 |
| 4.874999999999834 | 40.226 | 65.491 | 106.631 |
| 4.879999999999833 | 40.407 | 65.819 | 107.219 |
| 4.884999999999834 | 40.589 | 66.149 | 107.81 |
| 4.889999999999833 | 40.772 | 66.481 | 108.405 |
| 4.894999999999833 | 40.956 | 66.814 | 109.003 |
| 4.899999999999833 | 41.141 | 67.149 | 109.604 |
| 4.904999999999833 | 41.326 | 67.485 | 110.208 |
| 4.909999999999833 | 41.513 | 67.823 | 110.816 |
| 4.914999999999833 | 41.7 | 68.163 | 111.427 |
| 4.919999999999832 | 41.888 | 68.505 | 112.042 |
| 4.924999999999833 | 42.077 | 68.848 | 112.66 |
| 4.929999999999832 | 42.266 | 69.193 | 113.281 |
| 4.934999999999832 | 42.457 | 69.54 | 113.906 |
| 4.939999999999832 | 42.648 | 69.889 | 114.534 |
| 4.944999999999832 | 42.841 | 70.239 | 115.166 |
| 4.949999999999832 | 43.034 | 70.591 | 115.801 |
| 4.954999999999832 | 43.228 | 70.945 | 116.439 |
| 4.959999999999832 | 43.423 | 71.3 | 117.082 |
| 4.964999999999832 | 43.619 | 71.658 | 117.727 |
| 4.969999999999831 | 43.815 | 72.017 | 118.377 |
| 4.974999999999831 | 44.013 | 72.378 | 119.029 |
| 4.97999999999983 | 44.211 | 72.741 | 119.686 |
| 4.984999999999831 | 44.411 | 73.105 | 120.346 |
| 4.98999999999983 | 44.611 | 73.472 | 121.01 |
| 4.994999999999831 | 44.812 | 73.84 | 121.677 |
| 4.99999999999983 | 45.014 | 74.21 | 122.348 |